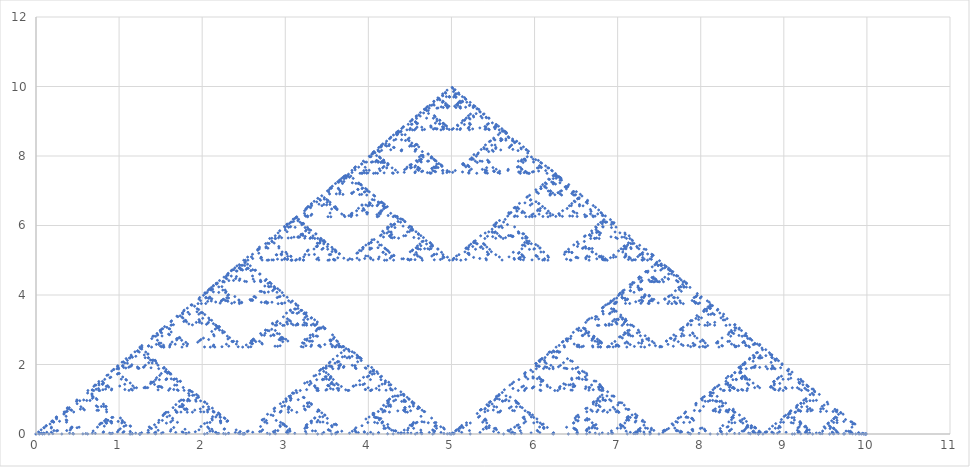
| Category | Series 0 |
|---|---|
| 0.0 | 0 |
| 0.0 | 0 |
| 2.5 | 5 |
| 1.25 | 2.5 |
| 0.625 | 1.25 |
| 2.8125 | 5.625 |
| 1.40625 | 2.812 |
| 5.703125 | 1.406 |
| 5.3515625 | 5.703 |
| 7.67578125 | 2.852 |
| 6.337890625 | 6.426 |
| 8.1689453125 | 3.213 |
| 9.08447265625 | 1.606 |
| 4.542236328125 | 0.803 |
| 4.7711181640625 | 5.402 |
| 4.88555908203125 | 7.701 |
| 2.442779541015625 | 3.85 |
| 6.2213897705078125 | 1.925 |
| 8.110694885253906 | 0.963 |
| 9.055347442626953 | 0.481 |
| 4.527673721313477 | 0.241 |
| 4.763836860656738 | 5.12 |
| 7.381918430328369 | 2.56 |
| 6.190959215164185 | 6.28 |
| 3.0954796075820923 | 3.14 |
| 4.047739803791046 | 6.57 |
| 4.523869901895523 | 8.285 |
| 7.2619349509477615 | 4.143 |
| 3.6309674754738808 | 2.071 |
| 4.31548373773694 | 6.036 |
| 2.15774186886847 | 3.018 |
| 6.078870934434235 | 1.509 |
| 3.0394354672171175 | 0.754 |
| 6.519717733608559 | 0.377 |
| 3.2598588668042794 | 0.189 |
| 4.12992943340214 | 5.094 |
| 4.56496471670107 | 7.547 |
| 4.782482358350535 | 8.774 |
| 7.3912411791752675 | 4.387 |
| 8.695620589587634 | 2.193 |
| 4.347810294793817 | 1.097 |
| 7.173905147396908 | 0.548 |
| 3.586952573698454 | 0.274 |
| 1.793476286849227 | 0.137 |
| 3.3967381434246136 | 5.069 |
| 6.698369071712307 | 2.534 |
| 8.349184535856153 | 1.267 |
| 4.174592267928077 | 0.634 |
| 7.087296133964038 | 0.317 |
| 8.54364806698202 | 0.158 |
| 9.27182403349101 | 0.079 |
| 4.635912016745505 | 0.04 |
| 2.3179560083727524 | 0.02 |
| 1.1589780041863762 | 0.01 |
| 3.0794890020931884 | 5.005 |
| 6.539744501046594 | 2.502 |
| 8.269872250523298 | 1.251 |
| 9.13493612526165 | 0.626 |
| 7.067468062630825 | 5.313 |
| 6.033734031315412 | 7.656 |
| 5.516867015657706 | 8.828 |
| 2.758433507828853 | 4.414 |
| 3.8792167539144264 | 7.207 |
| 1.9396083769572132 | 3.604 |
| 3.469804188478607 | 6.802 |
| 1.7349020942393034 | 3.401 |
| 0.8674510471196517 | 1.7 |
| 2.933725523559826 | 5.85 |
| 6.466862761779913 | 2.925 |
| 3.2334313808899564 | 1.463 |
| 6.616715690444979 | 0.731 |
| 3.3083578452224893 | 0.366 |
| 6.654178922611244 | 0.183 |
| 3.327089461305622 | 0.091 |
| 6.663544730652811 | 0.046 |
| 5.8317723653264055 | 5.023 |
| 5.415886182663202 | 7.511 |
| 7.707943091331601 | 3.756 |
| 8.8539715456658 | 1.878 |
| 4.4269857728329 | 0.939 |
| 7.21349288641645 | 0.469 |
| 8.606746443208225 | 0.235 |
| 6.8033732216041125 | 5.117 |
| 8.401686610802056 | 2.559 |
| 6.700843305401028 | 6.279 |
| 8.350421652700515 | 3.14 |
| 9.175210826350257 | 1.57 |
| 7.087605413175129 | 5.785 |
| 8.543802706587565 | 2.892 |
| 6.771901353293782 | 6.446 |
| 3.385950676646891 | 3.223 |
| 4.192975338323445 | 6.612 |
| 7.096487669161723 | 3.306 |
| 3.5482438345808616 | 1.653 |
| 1.7741219172904308 | 0.826 |
| 3.3870609586452156 | 5.413 |
| 1.6935304793226078 | 2.707 |
| 5.846765239661304 | 1.353 |
| 7.923382619830652 | 0.677 |
| 8.961691309915325 | 0.338 |
| 4.480845654957663 | 0.169 |
| 7.240422827478831 | 0.085 |
| 6.1202114137394155 | 5.042 |
| 5.560105706869708 | 7.521 |
| 2.780052853434854 | 3.761 |
| 6.3900264267174265 | 1.88 |
| 8.195013213358713 | 0.94 |
| 9.097506606679357 | 0.47 |
| 9.548753303339678 | 0.235 |
| 4.774376651669839 | 0.118 |
| 7.38718832583492 | 0.059 |
| 8.69359416291746 | 0.029 |
| 6.84679708145873 | 5.015 |
| 3.423398540729365 | 2.507 |
| 1.7116992703646825 | 1.254 |
| 3.3558496351823415 | 5.627 |
| 4.177924817591171 | 7.813 |
| 7.088962408795585 | 3.907 |
| 3.5444812043977927 | 1.953 |
| 1.7722406021988963 | 0.977 |
| 3.3861203010994485 | 5.488 |
| 1.6930601505497243 | 2.744 |
| 0.8465300752748621 | 1.372 |
| 0.42326503763743106 | 0.686 |
| 0.21163251881871553 | 0.343 |
| 2.6058162594093575 | 5.172 |
| 3.8029081297046785 | 7.586 |
| 4.40145406485234 | 8.793 |
| 4.70072703242617 | 9.396 |
| 2.350363516213085 | 4.698 |
| 6.175181758106543 | 2.349 |
| 3.0875908790532716 | 1.175 |
| 4.043795439526636 | 5.587 |
| 7.021897719763318 | 2.794 |
| 3.510948859881659 | 1.397 |
| 4.255474429940829 | 5.698 |
| 4.627737214970415 | 7.849 |
| 7.313868607485207 | 3.925 |
| 8.656934303742604 | 1.962 |
| 4.328467151871302 | 0.981 |
| 2.164233575935651 | 0.491 |
| 1.0821167879678255 | 0.245 |
| 5.541058393983913 | 0.123 |
| 7.770529196991957 | 0.061 |
| 6.385264598495978 | 5.031 |
| 3.192632299247989 | 2.515 |
| 1.5963161496239946 | 1.258 |
| 3.2981580748119974 | 5.629 |
| 4.149079037405999 | 7.814 |
| 2.0745395187029994 | 3.907 |
| 6.037269759351499 | 1.954 |
| 8.01863487967575 | 0.977 |
| 4.009317439837875 | 0.488 |
| 4.504658719918938 | 5.244 |
| 7.252329359959469 | 2.622 |
| 3.6261646799797345 | 1.311 |
| 4.313082339989867 | 5.656 |
| 7.1565411699949335 | 2.828 |
| 8.578270584997467 | 1.414 |
| 9.289135292498734 | 0.707 |
| 4.644567646249367 | 0.353 |
| 4.822283823124684 | 5.177 |
| 2.411141911562342 | 2.588 |
| 3.705570955781171 | 6.294 |
| 6.852785477890585 | 3.147 |
| 8.426392738945292 | 1.574 |
| 4.213196369472646 | 0.787 |
| 7.106598184736323 | 0.393 |
| 8.553299092368162 | 0.197 |
| 9.276649546184082 | 0.098 |
| 9.638324773092041 | 0.049 |
| 9.81916238654602 | 0.025 |
| 4.90958119327301 | 0.012 |
| 2.454790596636505 | 0.006 |
| 6.227395298318253 | 0.003 |
| 8.113697649159127 | 0.002 |
| 4.056848824579563 | 0.001 |
| 2.0284244122897817 | 0 |
| 3.514212206144891 | 5 |
| 1.7571061030724455 | 2.5 |
| 5.8785530515362225 | 1.25 |
| 2.9392765257681113 | 0.625 |
| 6.469638262884056 | 0.313 |
| 8.234819131442027 | 0.156 |
| 6.6174095657210135 | 5.078 |
| 5.808704782860507 | 7.539 |
| 5.404352391430253 | 8.77 |
| 2.7021761957151265 | 4.385 |
| 1.3510880978575632 | 2.192 |
| 0.6755440489287816 | 1.096 |
| 2.8377720244643907 | 5.548 |
| 3.9188860122321953 | 7.774 |
| 6.959443006116098 | 3.887 |
| 8.479721503058048 | 1.944 |
| 9.239860751529024 | 0.972 |
| 9.619930375764511 | 0.486 |
| 4.809965187882256 | 0.243 |
| 7.404982593941128 | 0.121 |
| 8.702491296970564 | 0.061 |
| 6.851245648485282 | 5.03 |
| 8.425622824242641 | 2.515 |
| 9.21281141212132 | 1.258 |
| 7.10640570606066 | 5.629 |
| 8.55320285303033 | 2.814 |
| 9.276601426515164 | 1.407 |
| 7.138300713257582 | 5.704 |
| 3.569150356628791 | 2.852 |
| 6.7845751783143955 | 1.426 |
| 8.392287589157197 | 0.713 |
| 9.1961437945786 | 0.356 |
| 7.0980718972893 | 5.178 |
| 3.54903594864465 | 2.589 |
| 6.774517974322325 | 1.295 |
| 3.3872589871611627 | 0.647 |
| 6.693629493580581 | 0.324 |
| 5.84681474679029 | 5.162 |
| 5.423407373395145 | 7.581 |
| 2.7117036866975726 | 3.79 |
| 6.355851843348786 | 1.895 |
| 8.177925921674394 | 0.948 |
| 4.088962960837197 | 0.474 |
| 7.0444814804185985 | 0.237 |
| 6.022240740209299 | 5.118 |
| 5.511120370104649 | 7.559 |
| 5.255560185052325 | 8.78 |
| 2.6277800925261623 | 4.39 |
| 1.3138900462630811 | 2.195 |
| 5.656945023131541 | 1.097 |
| 2.8284725115657703 | 0.549 |
| 3.9142362557828854 | 5.274 |
| 4.457118127891443 | 7.637 |
| 2.2285590639457213 | 3.819 |
| 3.6142795319728607 | 6.909 |
| 4.30713976598643 | 8.455 |
| 7.1535698829932155 | 4.227 |
| 6.076784941496608 | 7.114 |
| 8.038392470748304 | 3.557 |
| 6.519196235374152 | 6.778 |
| 3.259598117687076 | 3.389 |
| 6.629799058843538 | 1.695 |
| 3.314899529421769 | 0.847 |
| 6.657449764710885 | 0.424 |
| 8.328724882355441 | 0.212 |
| 9.16436244117772 | 0.106 |
| 9.582181220588861 | 0.053 |
| 4.791090610294431 | 0.026 |
| 7.395545305147215 | 0.013 |
| 8.697772652573608 | 0.007 |
| 6.848886326286804 | 5.003 |
| 5.924443163143402 | 7.502 |
| 2.962221581571701 | 3.751 |
| 3.9811107907858503 | 6.875 |
| 4.490555395392925 | 8.438 |
| 7.245277697696462 | 4.219 |
| 6.122638848848231 | 7.109 |
| 3.0613194244241155 | 3.555 |
| 6.530659712212058 | 1.777 |
| 8.265329856106028 | 0.889 |
| 4.132664928053014 | 0.444 |
| 7.066332464026507 | 0.222 |
| 6.0331662320132535 | 5.111 |
| 5.516583116006627 | 7.556 |
| 7.758291558003314 | 3.778 |
| 8.879145779001657 | 1.889 |
| 4.439572889500829 | 0.944 |
| 7.219786444750414 | 0.472 |
| 6.109893222375208 | 5.236 |
| 8.054946611187603 | 2.618 |
| 9.027473305593801 | 1.309 |
| 9.5137366527969 | 0.655 |
| 7.25686832639845 | 5.327 |
| 3.628434163199225 | 2.664 |
| 6.814217081599613 | 1.332 |
| 3.4071085407998063 | 0.666 |
| 4.203554270399903 | 5.333 |
| 4.601777135199951 | 7.666 |
| 7.3008885675999755 | 3.833 |
| 8.650444283799988 | 1.917 |
| 6.825222141899994 | 5.958 |
| 5.912611070949997 | 7.979 |
| 7.956305535474998 | 3.99 |
| 8.978152767737498 | 1.995 |
| 4.489076383868749 | 0.997 |
| 4.7445381919343745 | 5.499 |
| 4.872269095967187 | 7.749 |
| 7.436134547983594 | 3.875 |
| 6.218067273991797 | 6.937 |
| 5.609033636995898 | 8.469 |
| 2.804516818497949 | 4.234 |
| 1.4022584092489745 | 2.117 |
| 3.201129204624487 | 6.059 |
| 1.6005646023122435 | 3.029 |
| 0.8002823011561218 | 1.515 |
| 0.4001411505780609 | 0.757 |
| 0.20007057528903044 | 0.379 |
| 5.100035287644515 | 0.189 |
| 7.550017643822258 | 0.095 |
| 8.775008821911129 | 0.047 |
| 4.3875044109555645 | 0.024 |
| 7.193752205477782 | 0.012 |
| 8.596876102738891 | 0.006 |
| 4.298438051369446 | 0.003 |
| 4.649219025684722 | 5.001 |
| 7.324609512842361 | 2.501 |
| 6.162304756421181 | 6.25 |
| 8.08115237821059 | 3.125 |
| 6.540576189105295 | 6.563 |
| 8.270288094552647 | 3.281 |
| 6.635144047276324 | 6.641 |
| 8.317572023638162 | 3.32 |
| 4.158786011819081 | 1.66 |
| 7.079393005909541 | 0.83 |
| 6.0396965029547705 | 5.415 |
| 8.019848251477384 | 2.708 |
| 6.509924125738692 | 6.354 |
| 3.254962062869346 | 3.177 |
| 1.627481031434673 | 1.588 |
| 0.8137405157173365 | 0.794 |
| 5.406870257858668 | 0.397 |
| 5.203435128929334 | 5.199 |
| 2.601717564464667 | 2.599 |
| 3.8008587822323334 | 6.3 |
| 6.900429391116166 | 3.15 |
| 3.450214695558083 | 1.575 |
| 1.7251073477790415 | 0.787 |
| 0.8625536738895208 | 0.394 |
| 0.4312768369447604 | 0.197 |
| 0.2156384184723802 | 0.098 |
| 2.60781920923619 | 5.049 |
| 3.803909604618095 | 7.525 |
| 6.901954802309048 | 3.762 |
| 3.450977401154524 | 1.881 |
| 1.725488700577262 | 0.941 |
| 5.862744350288631 | 0.47 |
| 5.431372175144316 | 5.235 |
| 2.715686087572158 | 2.618 |
| 6.35784304378608 | 1.309 |
| 8.17892152189304 | 0.654 |
| 9.089460760946519 | 0.327 |
| 4.5447303804732595 | 0.164 |
| 7.27236519023663 | 0.082 |
| 8.636182595118315 | 0.041 |
| 6.818091297559158 | 5.02 |
| 5.909045648779578 | 7.51 |
| 5.454522824389789 | 8.755 |
| 7.727261412194895 | 4.378 |
| 3.8636307060974473 | 2.189 |
| 6.931815353048723 | 1.094 |
| 8.465907676524361 | 0.547 |
| 4.232953838262181 | 0.274 |
| 2.1164769191310904 | 0.137 |
| 1.0582384595655452 | 0.068 |
| 3.029119229782773 | 5.034 |
| 6.514559614891386 | 2.517 |
| 5.757279807445693 | 6.259 |
| 2.8786399037228465 | 3.129 |
| 1.4393199518614233 | 1.565 |
| 5.719659975930712 | 0.782 |
| 5.359829987965356 | 5.391 |
| 7.679914993982678 | 2.696 |
| 8.839957496991339 | 1.348 |
| 6.919978748495669 | 5.674 |
| 8.459989374247835 | 2.837 |
| 9.229994687123916 | 1.418 |
| 9.614997343561958 | 0.709 |
| 9.80749867178098 | 0.355 |
| 4.90374933589049 | 0.177 |
| 4.951874667945245 | 5.089 |
| 4.975937333972622 | 7.544 |
| 7.487968666986311 | 3.772 |
| 6.243984333493156 | 6.886 |
| 8.121992166746578 | 3.443 |
| 9.06099608337329 | 1.722 |
| 9.530498041686645 | 0.861 |
| 7.2652490208433225 | 5.43 |
| 6.132624510421661 | 7.715 |
| 5.56631225521083 | 8.858 |
| 5.283156127605415 | 9.429 |
| 2.6415780638027075 | 4.714 |
| 1.3207890319013538 | 2.357 |
| 3.160394515950677 | 6.179 |
| 4.080197257975339 | 8.089 |
| 2.0400986289876695 | 4.045 |
| 6.020049314493835 | 2.022 |
| 5.510024657246918 | 6.011 |
| 7.755012328623459 | 3.006 |
| 8.877506164311729 | 1.503 |
| 4.4387530821558645 | 0.751 |
| 2.2193765410779323 | 0.376 |
| 6.109688270538966 | 0.188 |
| 8.054844135269484 | 0.094 |
| 4.027422067634742 | 0.047 |
| 4.513711033817371 | 5.023 |
| 4.7568555169086855 | 7.512 |
| 7.378427758454343 | 3.756 |
| 6.189213879227172 | 6.878 |
| 5.594606939613586 | 8.439 |
| 5.297303469806793 | 9.219 |
| 7.648651734903396 | 4.61 |
| 6.324325867451698 | 7.305 |
| 5.662162933725849 | 8.652 |
| 2.8310814668629245 | 4.326 |
| 3.9155407334314623 | 7.163 |
| 1.9577703667157311 | 3.582 |
| 5.978885183357866 | 1.791 |
| 5.489442591678933 | 5.895 |
| 5.244721295839467 | 7.948 |
| 7.6223606479197334 | 3.974 |
| 6.311180323959867 | 6.987 |
| 5.655590161979934 | 8.493 |
| 2.827795080989967 | 4.247 |
| 1.4138975404949834 | 2.123 |
| 5.706948770247492 | 1.062 |
| 2.853474385123746 | 0.531 |
| 1.426737192561873 | 0.265 |
| 5.713368596280937 | 0.133 |
| 2.8566842981404683 | 0.066 |
| 1.4283421490702342 | 0.033 |
| 0.7141710745351171 | 0.017 |
| 2.8570855372675585 | 5.008 |
| 3.928542768633779 | 7.504 |
| 4.4642713843168895 | 8.752 |
| 4.732135692158445 | 9.376 |
| 7.366067846079222 | 4.688 |
| 8.683033923039611 | 2.344 |
| 9.341516961519805 | 1.172 |
| 7.170758480759902 | 5.586 |
| 6.085379240379951 | 7.793 |
| 5.542689620189975 | 8.897 |
| 2.7713448100949876 | 4.448 |
| 3.885672405047494 | 7.224 |
| 4.442836202523747 | 8.612 |
| 4.7214181012618734 | 9.306 |
| 7.360709050630937 | 4.653 |
| 6.180354525315469 | 7.327 |
| 8.090177262657734 | 3.663 |
| 9.045088631328866 | 1.832 |
| 9.522544315664433 | 0.916 |
| 4.761272157832217 | 0.458 |
| 4.880636078916108 | 5.229 |
| 7.440318039458054 | 2.614 |
| 6.220159019729027 | 6.307 |
| 8.110079509864514 | 3.154 |
| 9.055039754932256 | 1.577 |
| 7.027519877466128 | 5.788 |
| 6.013759938733064 | 7.894 |
| 8.006879969366532 | 3.947 |
| 6.503439984683266 | 6.974 |
| 3.251719992341633 | 3.487 |
| 6.625859996170817 | 1.743 |
| 3.3129299980854086 | 0.872 |
| 4.156464999042704 | 5.436 |
| 2.078232499521352 | 2.718 |
| 3.539116249760676 | 6.359 |
| 4.269558124880338 | 8.179 |
| 2.134779062440169 | 4.09 |
| 1.0673895312200845 | 2.045 |
| 5.533694765610042 | 1.022 |
| 5.266847382805021 | 5.511 |
| 7.633423691402511 | 2.756 |
| 3.8167118457012554 | 1.378 |
| 6.908355922850628 | 0.689 |
| 3.454177961425314 | 0.344 |
| 6.727088980712657 | 0.172 |
| 3.3635444903563285 | 0.086 |
| 1.6817722451781643 | 0.043 |
| 5.840886122589082 | 0.022 |
| 5.420443061294542 | 5.011 |
| 5.210221530647271 | 7.505 |
| 7.605110765323635 | 3.753 |
| 8.802555382661819 | 1.876 |
| 4.401277691330909 | 0.938 |
| 4.700638845665455 | 5.469 |
| 7.350319422832728 | 2.735 |
| 3.675159711416364 | 1.367 |
| 6.8375798557081815 | 0.684 |
| 3.4187899278540907 | 0.342 |
| 4.209394963927045 | 5.171 |
| 4.604697481963523 | 7.585 |
| 4.802348740981762 | 8.793 |
| 4.901174370490881 | 9.396 |
| 7.450587185245441 | 4.698 |
| 6.22529359262272 | 7.349 |
| 8.11264679631136 | 3.675 |
| 4.05632339815568 | 1.837 |
| 2.02816169907784 | 0.919 |
| 3.51408084953892 | 5.459 |
| 6.75704042476946 | 2.73 |
| 5.87852021238473 | 6.365 |
| 2.939260106192365 | 3.182 |
| 3.9696300530961826 | 6.591 |
| 6.984815026548091 | 3.296 |
| 3.4924075132740455 | 1.648 |
| 4.246203756637023 | 5.824 |
| 7.123101878318511 | 2.912 |
| 8.561550939159256 | 1.456 |
| 6.780775469579628 | 5.728 |
| 5.8903877347898135 | 7.864 |
| 5.445193867394907 | 8.932 |
| 5.222596933697453 | 9.466 |
| 7.6112984668487265 | 4.733 |
| 3.8056492334243632 | 2.366 |
| 4.402824616712182 | 6.183 |
| 2.201412308356091 | 3.092 |
| 6.100706154178045 | 1.546 |
| 5.550353077089023 | 5.773 |
| 7.775176538544511 | 2.886 |
| 8.887588269272255 | 1.443 |
| 9.443794134636128 | 0.722 |
| 9.721897067318064 | 0.361 |
| 7.360948533659032 | 5.18 |
| 8.680474266829517 | 2.59 |
| 9.340237133414758 | 1.295 |
| 4.670118566707379 | 0.648 |
| 4.83505928335369 | 5.324 |
| 7.417529641676845 | 2.662 |
| 8.708764820838422 | 1.331 |
| 4.354382410419211 | 0.665 |
| 4.677191205209605 | 5.333 |
| 4.838595602604803 | 7.666 |
| 7.419297801302402 | 3.833 |
| 8.709648900651201 | 1.917 |
| 9.354824450325602 | 0.958 |
| 7.177412225162801 | 5.479 |
| 8.5887061125814 | 2.74 |
| 9.2943530562907 | 1.37 |
| 4.64717652814535 | 0.685 |
| 7.323588264072675 | 0.342 |
| 8.661794132036338 | 0.171 |
| 4.330897066018169 | 0.086 |
| 2.1654485330090845 | 0.043 |
| 3.5827242665045422 | 5.021 |
| 6.791362133252271 | 2.511 |
| 5.8956810666261354 | 6.255 |
| 5.447840533313068 | 8.128 |
| 5.223920266656534 | 9.064 |
| 5.111960133328267 | 9.532 |
| 2.5559800666641337 | 4.766 |
| 6.277990033332067 | 2.383 |
| 3.1389950166660334 | 1.191 |
| 4.069497508333017 | 5.596 |
| 7.034748754166508 | 2.798 |
| 3.517374377083254 | 1.399 |
| 4.258687188541627 | 5.699 |
| 7.129343594270813 | 2.85 |
| 6.064671797135407 | 6.425 |
| 5.532335898567704 | 8.212 |
| 7.766167949283852 | 4.106 |
| 6.3830839746419255 | 7.053 |
| 5.691541987320963 | 8.527 |
| 5.345770993660482 | 9.263 |
| 5.172885496830241 | 9.632 |
| 5.08644274841512 | 9.816 |
| 5.04322137420756 | 9.908 |
| 2.52161068710378 | 4.954 |
| 3.76080534355189 | 7.477 |
| 6.880402671775945 | 3.738 |
| 5.940201335887973 | 6.869 |
| 5.470100667943987 | 8.435 |
| 7.735050333971993 | 4.217 |
| 6.367525166985997 | 7.109 |
| 5.683762583492999 | 8.554 |
| 5.3418812917465 | 9.277 |
| 5.17094064587325 | 9.639 |
| 7.585470322936625 | 4.819 |
| 6.292735161468313 | 7.41 |
| 5.6463675807341565 | 8.705 |
| 7.823183790367079 | 4.352 |
| 6.411591895183539 | 7.176 |
| 8.20579594759177 | 3.588 |
| 4.102897973795885 | 1.794 |
| 7.051448986897943 | 0.897 |
| 8.52572449344897 | 0.449 |
| 9.262862246724485 | 0.224 |
| 4.631431123362242 | 0.112 |
| 7.315715561681121 | 0.056 |
| 8.65785778084056 | 0.028 |
| 6.82892889042028 | 5.014 |
| 8.41446444521014 | 2.507 |
| 6.70723222260507 | 6.254 |
| 3.353616111302535 | 3.127 |
| 4.176808055651268 | 6.563 |
| 2.088404027825634 | 3.282 |
| 1.044202013912817 | 1.641 |
| 3.0221010069564085 | 5.82 |
| 1.5110505034782042 | 2.91 |
| 0.7555252517391021 | 1.455 |
| 0.37776262586955106 | 0.728 |
| 0.18888131293477553 | 0.364 |
| 0.09444065646738777 | 0.182 |
| 2.547220328233694 | 5.091 |
| 1.273610164116847 | 2.545 |
| 5.636805082058424 | 1.273 |
| 7.8184025410292115 | 0.636 |
| 6.409201270514606 | 5.318 |
| 8.204600635257304 | 2.659 |
| 9.102300317628652 | 1.33 |
| 7.051150158814326 | 5.665 |
| 8.525575079407163 | 2.832 |
| 4.262787539703582 | 1.416 |
| 4.63139376985179 | 5.708 |
| 4.815696884925895 | 7.854 |
| 4.907848442462948 | 8.927 |
| 2.453924221231474 | 4.464 |
| 6.226962110615737 | 2.232 |
| 8.113481055307869 | 1.116 |
| 9.056740527653934 | 0.558 |
| 4.528370263826967 | 0.279 |
| 2.2641851319134836 | 0.139 |
| 3.632092565956742 | 5.07 |
| 1.816046282978371 | 2.535 |
| 0.9080231414891855 | 1.267 |
| 0.45401157074459275 | 0.634 |
| 5.227005785372296 | 0.317 |
| 7.613502892686148 | 0.158 |
| 3.806751446343074 | 0.079 |
| 4.403375723171537 | 5.04 |
| 7.201687861585769 | 2.52 |
| 6.100843930792884 | 6.26 |
| 8.050421965396442 | 3.13 |
| 4.025210982698221 | 1.565 |
| 2.0126054913491105 | 0.782 |
| 3.5063027456745552 | 5.391 |
| 1.7531513728372776 | 2.696 |
| 0.8765756864186388 | 1.348 |
| 5.43828784320932 | 0.674 |
| 7.71914392160466 | 0.337 |
| 6.35957196080233 | 5.168 |
| 5.6797859804011654 | 7.584 |
| 2.8398929902005827 | 3.792 |
| 3.9199464951002914 | 6.896 |
| 1.9599732475501457 | 3.448 |
| 0.9799866237750728 | 1.724 |
| 5.489993311887536 | 0.862 |
| 2.744996655943768 | 0.431 |
| 3.872498327971884 | 5.216 |
| 4.436249163985942 | 7.608 |
| 7.218124581992971 | 3.804 |
| 8.609062290996485 | 1.902 |
| 4.304531145498243 | 0.951 |
| 7.152265572749121 | 0.475 |
| 6.0761327863745604 | 5.238 |
| 5.538066393187281 | 7.619 |
| 2.7690331965936403 | 3.809 |
| 1.3845165982968202 | 1.905 |
| 5.69225829914841 | 0.952 |
| 7.846129149574205 | 0.476 |
| 3.9230645747871025 | 0.238 |
| 1.9615322873935512 | 0.119 |
| 0.9807661436967756 | 0.06 |
| 2.990383071848388 | 5.03 |
| 3.995191535924194 | 7.515 |
| 4.497595767962097 | 8.757 |
| 2.2487978839810485 | 4.379 |
| 1.1243989419905243 | 2.189 |
| 5.562199470995262 | 1.095 |
| 5.281099735497631 | 5.547 |
| 5.140549867748815 | 7.774 |
| 7.5702749338744075 | 3.887 |
| 6.285137466937204 | 6.943 |
| 8.142568733468602 | 3.472 |
| 4.071284366734301 | 1.736 |
| 4.53564218336715 | 5.868 |
| 2.267821091683575 | 2.934 |
| 1.1339105458417875 | 1.467 |
| 0.5669552729208938 | 0.733 |
| 0.2834776364604469 | 0.367 |
| 5.141738818230223 | 0.183 |
| 7.570869409115112 | 0.092 |
| 8.785434704557556 | 0.046 |
| 4.392717352278778 | 0.023 |
| 7.196358676139389 | 0.011 |
| 6.098179338069695 | 5.006 |
| 8.049089669034847 | 2.503 |
| 4.024544834517424 | 1.251 |
| 7.012272417258712 | 0.626 |
| 3.506136208629356 | 0.313 |
| 6.7530681043146785 | 0.156 |
| 5.876534052157339 | 5.078 |
| 2.9382670260786696 | 2.539 |
| 1.4691335130393348 | 1.27 |
| 3.2345667565196674 | 5.635 |
| 4.117283378259834 | 7.817 |
| 7.058641689129917 | 3.909 |
| 3.5293208445649586 | 1.954 |
| 6.764660422282479 | 0.977 |
| 8.38233021114124 | 0.489 |
| 6.69116510557062 | 5.244 |
| 5.845582552785309 | 7.622 |
| 7.922791276392655 | 3.811 |
| 8.961395638196327 | 1.906 |
| 6.980697819098164 | 5.953 |
| 8.490348909549082 | 2.976 |
| 4.245174454774541 | 1.488 |
| 2.1225872273872706 | 0.744 |
| 3.5612936136936355 | 5.372 |
| 6.780646806846818 | 2.686 |
| 8.390323403423409 | 1.343 |
| 4.195161701711704 | 0.672 |
| 4.597580850855852 | 5.336 |
| 7.298790425427926 | 2.668 |
| 8.649395212713962 | 1.334 |
| 9.324697606356981 | 0.667 |
| 7.1623488031784905 | 5.333 |
| 6.081174401589245 | 7.667 |
| 3.0405872007946226 | 3.833 |
| 6.520293600397311 | 1.917 |
| 5.7601468001986555 | 5.958 |
| 2.8800734000993278 | 2.979 |
| 3.9400367000496637 | 6.49 |
| 1.9700183500248318 | 3.245 |
| 5.985009175012416 | 1.622 |
| 2.992504587506208 | 0.811 |
| 6.496252293753104 | 0.406 |
| 3.248126146876552 | 0.203 |
| 6.6240630734382755 | 0.101 |
| 5.812031536719138 | 5.051 |
| 5.406015768359569 | 7.525 |
| 7.703007884179785 | 3.763 |
| 8.851503942089892 | 1.881 |
| 6.925751971044946 | 5.941 |
| 5.962875985522473 | 7.97 |
| 2.9814379927612364 | 3.985 |
| 3.990718996380618 | 6.993 |
| 1.995359498190309 | 3.496 |
| 3.4976797490951546 | 6.748 |
| 6.748839874547578 | 3.374 |
| 8.374419937273789 | 1.687 |
| 6.687209968636894 | 5.844 |
| 8.343604984318446 | 2.922 |
| 6.671802492159223 | 6.461 |
| 5.835901246079612 | 8.23 |
| 5.417950623039806 | 9.115 |
| 7.708975311519903 | 4.558 |
| 8.854487655759952 | 2.279 |
| 9.427243827879977 | 1.139 |
| 9.713621913939988 | 0.57 |
| 9.856810956969994 | 0.285 |
| 7.428405478484997 | 5.142 |
| 6.2142027392424986 | 7.571 |
| 5.607101369621249 | 8.786 |
| 7.803550684810625 | 4.393 |
| 3.9017753424053123 | 2.196 |
| 1.9508876712026562 | 1.098 |
| 5.975443835601328 | 0.549 |
| 2.987721917800664 | 0.275 |
| 6.493860958900331 | 0.137 |
| 8.246930479450166 | 0.069 |
| 4.123465239725083 | 0.034 |
| 4.561732619862541 | 5.017 |
| 7.2808663099312705 | 2.509 |
| 3.6404331549656352 | 1.254 |
| 1.8202165774828176 | 0.627 |
| 0.9101082887414088 | 0.314 |
| 2.9550541443707043 | 5.157 |
| 1.4775270721853522 | 2.578 |
| 3.238763536092676 | 6.289 |
| 4.119381768046338 | 8.145 |
| 2.059690884023169 | 4.072 |
| 3.5298454420115846 | 7.036 |
| 4.264922721005792 | 8.518 |
| 2.132461360502896 | 4.259 |
| 3.566230680251448 | 7.13 |
| 1.783115340125724 | 3.565 |
| 3.391557670062862 | 6.782 |
| 1.695778835031431 | 3.391 |
| 3.3478894175157157 | 6.696 |
| 4.173944708757858 | 8.348 |
| 2.086972354378929 | 4.174 |
| 3.5434861771894646 | 7.087 |
| 4.271743088594732 | 8.543 |
| 2.135871544297366 | 4.272 |
| 6.067935772148683 | 2.136 |
| 5.5339678860743415 | 6.068 |
| 7.766983943037171 | 3.034 |
| 8.883491971518586 | 1.517 |
| 4.441745985759293 | 0.758 |
| 2.2208729928796465 | 0.379 |
| 6.110436496439823 | 0.19 |
| 8.055218248219912 | 0.095 |
| 9.027609124109956 | 0.047 |
| 4.513804562054978 | 0.024 |
| 2.256902281027489 | 0.012 |
| 1.1284511405137445 | 0.006 |
| 0.5642255702568723 | 0.003 |
| 2.782112785128436 | 5.001 |
| 1.391056392564218 | 2.501 |
| 0.695528196282109 | 1.25 |
| 0.3477640981410545 | 0.625 |
| 2.6738820490705275 | 5.313 |
| 3.836941024535264 | 7.656 |
| 6.918470512267632 | 3.828 |
| 8.459235256133816 | 1.914 |
| 4.229617628066908 | 0.957 |
| 7.114808814033454 | 0.479 |
| 3.557404407016727 | 0.239 |
| 4.278702203508363 | 5.12 |
| 2.1393511017541815 | 2.56 |
| 1.0696755508770908 | 1.28 |
| 3.0348377754385454 | 5.64 |
| 1.5174188877192727 | 2.82 |
| 0.7587094438596363 | 1.41 |
| 2.879354721929818 | 5.705 |
| 3.939677360964909 | 7.852 |
| 1.9698386804824546 | 3.926 |
| 0.9849193402412273 | 1.963 |
| 0.49245967012061365 | 0.982 |
| 0.24622983506030682 | 0.491 |
| 5.123114917530153 | 0.245 |
| 5.061557458765076 | 5.123 |
| 2.530778729382538 | 2.561 |
| 3.765389364691269 | 6.281 |
| 1.8826946823456345 | 3.14 |
| 3.4413473411728175 | 6.57 |
| 4.220673670586409 | 8.285 |
| 2.1103368352932046 | 4.143 |
| 3.5551684176466023 | 7.071 |
| 1.7775842088233011 | 3.536 |
| 5.8887921044116505 | 1.768 |
| 7.944396052205825 | 0.884 |
| 6.472198026102912 | 5.442 |
| 3.236099013051456 | 2.721 |
| 6.618049506525728 | 1.36 |
| 8.309024753262864 | 0.68 |
| 6.654512376631432 | 5.34 |
| 3.327256188315716 | 2.67 |
| 6.663628094157858 | 1.335 |
| 8.331814047078929 | 0.668 |
| 4.165907023539464 | 0.334 |
| 4.582953511769732 | 5.167 |
| 2.291476755884866 | 2.583 |
| 1.145738377942433 | 1.292 |
| 3.0728691889712163 | 5.646 |
| 4.036434594485608 | 7.823 |
| 4.5182172972428045 | 8.911 |
| 7.259108648621402 | 4.456 |
| 6.129554324310702 | 7.228 |
| 5.564777162155351 | 8.614 |
| 7.782388581077676 | 4.307 |
| 8.891194290538838 | 2.153 |
| 6.945597145269419 | 6.077 |
| 3.4727985726347095 | 3.038 |
| 1.7363992863173547 | 1.519 |
| 3.368199643158677 | 5.76 |
| 4.184099821579339 | 7.88 |
| 2.0920499107896693 | 3.94 |
| 1.0460249553948346 | 1.97 |
| 3.023012477697417 | 5.985 |
| 4.011506238848709 | 7.992 |
| 4.505753119424354 | 8.996 |
| 7.252876559712178 | 4.498 |
| 3.626438279856089 | 2.249 |
| 6.813219139928044 | 1.125 |
| 5.906609569964022 | 5.562 |
| 2.953304784982011 | 2.781 |
| 6.4766523924910055 | 1.391 |
| 5.738326196245502 | 5.695 |
| 5.369163098122751 | 7.848 |
| 7.684581549061376 | 3.924 |
| 3.842290774530688 | 1.962 |
| 1.921145387265344 | 0.981 |
| 5.960572693632672 | 0.49 |
| 5.480286346816336 | 5.245 |
| 5.240143173408168 | 7.623 |
| 7.620071586704084 | 3.811 |
| 6.310035793352042 | 6.906 |
| 5.655017896676021 | 8.453 |
| 7.827508948338011 | 4.226 |
| 3.9137544741690053 | 2.113 |
| 1.9568772370845027 | 1.057 |
| 3.4784386185422513 | 5.528 |
| 4.2392193092711254 | 7.764 |
| 7.119609654635562 | 3.882 |
| 3.559804827317781 | 1.941 |
| 4.27990241365889 | 5.971 |
| 7.139951206829445 | 2.985 |
| 6.069975603414722 | 6.493 |
| 5.534987801707361 | 8.246 |
| 5.2674939008536805 | 9.123 |
| 5.13374695042684 | 9.562 |
| 7.56687347521342 | 4.781 |
| 6.28343673760671 | 7.39 |
| 8.141718368803355 | 3.695 |
| 6.5708591844016775 | 6.848 |
| 5.785429592200838 | 8.424 |
| 5.392714796100419 | 9.212 |
| 2.6963573980502096 | 4.606 |
| 1.3481786990251048 | 2.303 |
| 0.6740893495125524 | 1.151 |
| 0.3370446747562762 | 0.576 |
| 0.1685223373781381 | 0.288 |
| 5.0842611686890695 | 0.144 |
| 2.5421305843445348 | 0.072 |
| 1.2710652921722674 | 0.036 |
| 3.1355326460861335 | 5.018 |
| 6.567766323043067 | 2.509 |
| 8.283883161521533 | 1.254 |
| 9.141941580760767 | 0.627 |
| 4.570970790380383 | 0.314 |
| 4.785485395190191 | 5.157 |
| 4.892742697595096 | 7.578 |
| 4.946371348797548 | 8.789 |
| 7.473185674398774 | 4.395 |
| 8.736592837199387 | 2.197 |
| 6.8682964185996935 | 6.099 |
| 3.4341482092998468 | 3.049 |
| 6.717074104649923 | 1.525 |
| 5.858537052324961 | 5.762 |
| 2.9292685261624807 | 2.881 |
| 6.464634263081241 | 1.441 |
| 3.2323171315406203 | 0.72 |
| 4.11615856577031 | 5.36 |
| 4.558079282885155 | 7.68 |
| 2.2790396414425773 | 3.84 |
| 6.139519820721288 | 1.92 |
| 5.569759910360644 | 5.96 |
| 7.7848799551803225 | 2.98 |
| 6.392439977590161 | 6.49 |
| 5.696219988795081 | 8.245 |
| 2.8481099943975403 | 4.123 |
| 3.92405499719877 | 7.061 |
| 6.962027498599385 | 3.531 |
| 8.481013749299692 | 1.765 |
| 6.740506874649846 | 5.883 |
| 8.370253437324923 | 2.941 |
| 9.185126718662461 | 1.471 |
| 4.592563359331231 | 0.735 |
| 7.296281679665615 | 0.368 |
| 8.648140839832807 | 0.184 |
| 4.324070419916404 | 0.092 |
| 2.162035209958202 | 0.046 |
| 3.5810176049791007 | 5.023 |
| 4.29050880248955 | 7.511 |
| 7.145254401244776 | 3.756 |
| 3.572627200622388 | 1.878 |
| 6.786313600311194 | 0.939 |
| 8.393156800155598 | 0.469 |
| 6.696578400077799 | 5.235 |
| 5.8482892000388995 | 7.617 |
| 7.924144600019449 | 3.809 |
| 3.9620723000097247 | 1.904 |
| 1.9810361500048623 | 0.952 |
| 5.990518075002432 | 0.476 |
| 2.995259037501216 | 0.238 |
| 3.9976295187506077 | 5.119 |
| 6.998814759375303 | 2.56 |
| 3.4994073796876517 | 1.28 |
| 6.749703689843826 | 0.64 |
| 8.374851844921913 | 0.32 |
| 4.187425922460957 | 0.16 |
| 2.0937129612304783 | 0.08 |
| 1.0468564806152392 | 0.04 |
| 3.0234282403076196 | 5.02 |
| 1.5117141201538098 | 2.51 |
| 0.7558570600769049 | 1.255 |
| 2.8779285300384525 | 5.627 |
| 6.4389642650192265 | 2.814 |
| 8.219482132509613 | 1.407 |
| 6.609741066254807 | 5.703 |
| 5.804870533127403 | 7.852 |
| 2.9024352665637014 | 3.926 |
| 3.9512176332818507 | 6.963 |
| 4.475608816640925 | 8.481 |
| 2.2378044083204625 | 4.241 |
| 6.118902204160231 | 2.12 |
| 3.0594511020801156 | 1.06 |
| 1.5297255510400578 | 0.53 |
| 3.2648627755200286 | 5.265 |
| 4.132431387760015 | 7.633 |
| 2.0662156938800074 | 3.816 |
| 3.5331078469400037 | 6.908 |
| 1.7665539234700018 | 3.454 |
| 5.8832769617350005 | 1.727 |
| 7.9416384808675 | 0.864 |
| 3.97081924043375 | 0.432 |
| 1.985409620216875 | 0.216 |
| 0.9927048101084375 | 0.108 |
| 2.996352405054219 | 5.054 |
| 1.4981762025271095 | 2.527 |
| 3.2490881012635544 | 6.263 |
| 1.6245440506317772 | 3.132 |
| 5.812272025315889 | 1.566 |
| 5.406136012657944 | 5.783 |
| 2.703068006328972 | 2.891 |
| 6.3515340031644865 | 1.446 |
| 8.175767001582244 | 0.723 |
| 6.587883500791122 | 5.361 |
| 5.793941750395561 | 7.681 |
| 7.8969708751977805 | 3.84 |
| 6.44848543759889 | 6.92 |
| 3.224242718799445 | 3.46 |
| 1.6121213593997226 | 1.73 |
| 3.3060606796998613 | 5.865 |
| 6.653030339849931 | 2.933 |
| 8.326515169924965 | 1.466 |
| 6.663257584962483 | 5.733 |
| 8.331628792481242 | 2.867 |
| 4.165814396240621 | 1.433 |
| 2.0829071981203104 | 0.717 |
| 1.0414535990601552 | 0.358 |
| 3.0207267995300775 | 5.179 |
| 4.010363399765039 | 7.59 |
| 4.505181699882519 | 8.795 |
| 2.2525908499412597 | 4.397 |
| 6.12629542497063 | 2.199 |
| 3.063147712485315 | 1.099 |
| 1.5315738562426575 | 0.55 |
| 0.7657869281213288 | 0.275 |
| 5.382893464060664 | 0.137 |
| 2.691446732030332 | 0.069 |
| 1.345723366015166 | 0.034 |
| 3.172861683007583 | 5.017 |
| 4.086430841503791 | 7.509 |
| 2.0432154207518956 | 3.754 |
| 6.021607710375948 | 1.877 |
| 3.010803855187974 | 0.939 |
| 4.0054019275939865 | 5.469 |
| 4.502700963796993 | 7.735 |
| 4.751350481898497 | 8.867 |
| 7.375675240949248 | 4.434 |
| 3.687837620474624 | 2.217 |
| 1.843918810237312 | 1.108 |
| 3.421959405118656 | 5.554 |
| 6.710979702559328 | 2.777 |
| 3.355489851279664 | 1.389 |
| 6.677744925639832 | 0.694 |
| 8.338872462819916 | 0.347 |
| 9.169436231409957 | 0.174 |
| 7.084718115704979 | 5.087 |
| 8.54235905785249 | 2.543 |
| 4.271179528926245 | 1.272 |
| 2.1355897644631225 | 0.636 |
| 6.067794882231562 | 0.318 |
| 5.533897441115781 | 5.159 |
| 7.76694872055789 | 2.579 |
| 8.883474360278946 | 1.29 |
| 9.441737180139473 | 0.645 |
| 4.7208685900697365 | 0.322 |
| 7.360434295034868 | 0.161 |
| 3.680217147517434 | 0.081 |
| 1.840108573758717 | 0.04 |
| 0.9200542868793585 | 0.02 |
| 2.960027143439679 | 5.01 |
| 3.9800135717198395 | 7.505 |
| 1.9900067858599197 | 3.753 |
| 0.9950033929299599 | 1.876 |
| 2.9975016964649797 | 5.938 |
| 1.4987508482324898 | 2.969 |
| 3.249375424116245 | 6.485 |
| 4.1246877120581225 | 8.242 |
| 7.062343856029061 | 4.121 |
| 8.53117192801453 | 2.061 |
| 6.765585964007265 | 6.03 |
| 3.3827929820036324 | 3.015 |
| 4.191396491001816 | 6.508 |
| 7.095698245500908 | 3.254 |
| 3.547849122750454 | 1.627 |
| 4.273924561375227 | 5.813 |
| 4.636962280687614 | 7.907 |
| 7.318481140343807 | 3.953 |
| 3.6592405701719035 | 1.977 |
| 1.8296202850859518 | 0.988 |
| 3.4148101425429758 | 5.494 |
| 6.707405071271488 | 2.747 |
| 3.353702535635744 | 1.374 |
| 1.676851267817872 | 0.687 |
| 0.838425633908936 | 0.343 |
| 0.419212816954468 | 0.172 |
| 2.7096064084772338 | 5.086 |
| 6.3548032042386176 | 2.543 |
| 5.677401602119309 | 6.271 |
| 7.838700801059654 | 3.136 |
| 6.419350400529828 | 6.568 |
| 5.709675200264914 | 8.284 |
| 5.354837600132457 | 9.142 |
| 7.677418800066229 | 4.571 |
| 8.838709400033114 | 2.285 |
| 4.419354700016557 | 1.143 |
| 2.2096773500082785 | 0.571 |
| 6.104838675004139 | 0.286 |
| 3.0524193375020694 | 0.143 |
| 4.026209668751035 | 5.071 |
| 7.013104834375517 | 2.536 |
| 6.006552417187759 | 6.268 |
| 5.50327620859388 | 8.134 |
| 2.75163810429694 | 4.067 |
| 3.87581905214847 | 7.033 |
| 1.937909526074235 | 3.517 |
| 3.468954763037117 | 6.758 |
| 6.734477381518559 | 3.379 |
| 3.3672386907592795 | 1.69 |
| 1.6836193453796398 | 0.845 |
| 0.8418096726898199 | 0.422 |
| 5.42090483634491 | 0.211 |
| 7.710452418172455 | 0.106 |
| 8.855226209086227 | 0.053 |
| 9.427613104543113 | 0.026 |
| 7.213806552271556 | 5.013 |
| 3.606903276135778 | 2.507 |
| 6.803451638067889 | 1.253 |
| 8.401725819033945 | 0.627 |
| 9.200862909516973 | 0.313 |
| 9.600431454758485 | 0.157 |
| 9.800215727379243 | 0.078 |
| 9.900107863689621 | 0.039 |
| 9.95005393184481 | 0.02 |
| 4.975026965922405 | 0.01 |
| 2.4875134829612024 | 0.005 |
| 1.2437567414806012 | 0.002 |
| 0.6218783707403006 | 0.001 |
| 0.3109391853701503 | 0.001 |
| 0.15546959268507515 | 0 |
| 0.07773479634253758 | 0 |
| 0.03886739817126879 | 0 |
| 2.519433699085634 | 5 |
| 6.2597168495428175 | 2.5 |
| 3.1298584247714087 | 1.25 |
| 1.5649292123857044 | 0.625 |
| 0.7824646061928522 | 0.313 |
| 2.8912323030964258 | 5.156 |
| 3.945616151548213 | 7.578 |
| 6.972808075774106 | 3.789 |
| 3.486404037887053 | 1.895 |
| 4.243202018943526 | 5.947 |
| 7.121601009471763 | 2.974 |
| 3.5608005047358815 | 1.487 |
| 4.280400252367941 | 5.743 |
| 7.14020012618397 | 2.872 |
| 3.570100063091985 | 1.436 |
| 1.7850500315459925 | 0.718 |
| 5.892525015772996 | 0.359 |
| 5.446262507886498 | 5.179 |
| 2.723131253943249 | 2.59 |
| 3.8615656269716245 | 6.295 |
| 6.930782813485813 | 3.147 |
| 3.4653914067429064 | 1.574 |
| 1.7326957033714532 | 0.787 |
| 0.8663478516857266 | 0.393 |
| 0.4331739258428633 | 0.197 |
| 5.216586962921431 | 0.098 |
| 2.6082934814607155 | 0.049 |
| 3.8041467407303577 | 5.025 |
| 6.902073370365178 | 2.512 |
| 8.45103668518259 | 1.256 |
| 6.725518342591295 | 5.628 |
| 5.8627591712956475 | 7.814 |
| 5.431379585647823 | 8.907 |
| 5.215689792823912 | 9.454 |
| 2.607844896411956 | 4.727 |
| 6.303922448205977 | 2.363 |
| 8.151961224102989 | 1.182 |
| 9.075980612051495 | 0.591 |
| 4.537990306025748 | 0.295 |
| 2.268995153012874 | 0.148 |
| 1.134497576506437 | 0.074 |
| 5.5672487882532184 | 0.037 |
| 2.7836243941266092 | 0.018 |
| 3.8918121970633046 | 5.009 |
| 6.945906098531653 | 2.505 |
| 5.9729530492658265 | 6.252 |
| 2.9864765246329132 | 3.126 |
| 3.9932382623164564 | 6.563 |
| 4.496619131158228 | 8.282 |
| 2.248309565579114 | 4.141 |
| 6.124154782789557 | 2.07 |
| 3.0620773913947783 | 1.035 |
| 4.031038695697389 | 5.518 |
| 2.0155193478486946 | 2.759 |
| 1.0077596739243473 | 1.379 |
| 5.503879836962174 | 0.69 |
| 2.751939918481087 | 0.345 |
| 1.3759699592405434 | 0.172 |
| 0.6879849796202717 | 0.086 |
| 5.343992489810136 | 0.043 |
| 5.171996244905068 | 5.022 |
| 2.585998122452534 | 2.511 |
| 3.7929990612262667 | 6.255 |
| 6.896499530613133 | 3.128 |
| 3.4482497653065667 | 1.564 |
| 4.224124882653284 | 5.782 |
| 4.612062441326642 | 7.891 |
| 4.806031220663321 | 8.945 |
| 2.4030156103316607 | 4.473 |
| 1.2015078051658303 | 2.236 |
| 3.100753902582915 | 6.118 |
| 4.050376951291458 | 8.059 |
| 4.525188475645729 | 9.03 |
| 2.2625942378228645 | 4.515 |
| 3.6312971189114323 | 7.257 |
| 6.815648559455717 | 3.629 |
| 5.907824279727858 | 6.814 |
| 7.953912139863929 | 3.407 |
| 6.476956069931965 | 6.704 |
| 3.2384780349659823 | 3.352 |
| 4.119239017482991 | 6.676 |
| 7.059619508741496 | 3.338 |
| 8.529809754370747 | 1.669 |
| 4.264904877185374 | 0.834 |
| 4.632452438592686 | 5.417 |
| 4.816226219296343 | 7.709 |
| 7.408113109648172 | 3.854 |
| 3.704056554824086 | 1.927 |
| 6.8520282774120425 | 0.964 |
| 5.926014138706021 | 5.482 |
| 2.9630070693530106 | 2.741 |
| 6.481503534676506 | 1.37 |
| 5.740751767338253 | 5.685 |
| 7.870375883669126 | 2.843 |
| 3.935187941834563 | 1.421 |
| 6.967593970917282 | 0.711 |
| 8.48379698545864 | 0.355 |
| 6.74189849272932 | 5.178 |
| 8.37094924636466 | 2.589 |
| 9.18547462318233 | 1.294 |
| 9.592737311591165 | 0.647 |
| 4.7963686557955825 | 0.324 |
| 4.898184327897791 | 5.162 |
| 4.949092163948896 | 7.581 |
| 2.474546081974448 | 3.79 |
| 1.237273040987224 | 1.895 |
| 3.118636520493612 | 5.948 |
| 6.5593182602468065 | 2.974 |
| 5.779659130123403 | 6.487 |
| 5.389829565061701 | 8.243 |
| 7.694914782530851 | 4.122 |
| 8.847457391265426 | 2.061 |
| 6.923728695632713 | 6.03 |
| 8.461864347816356 | 3.015 |
| 9.230932173908178 | 1.508 |
| 4.615466086954089 | 0.754 |
| 2.3077330434770444 | 0.377 |
| 6.1538665217385216 | 0.188 |
| 5.576933260869261 | 5.094 |
| 7.78846663043463 | 2.547 |
| 8.894233315217315 | 1.274 |
| 4.447116657608658 | 0.637 |
| 2.223558328804329 | 0.318 |
| 6.111779164402165 | 0.159 |
| 3.0558895822010825 | 0.08 |
| 1.5279447911005413 | 0.04 |
| 5.763972395550271 | 0.02 |
| 2.8819861977751353 | 0.01 |
| 1.4409930988875677 | 0.005 |
| 3.2204965494437836 | 5.002 |
| 4.110248274721892 | 7.501 |
| 4.555124137360946 | 8.751 |
| 7.2775620686804725 | 4.375 |
| 8.638781034340237 | 2.188 |
| 4.319390517170119 | 1.094 |
| 4.659695258585059 | 5.547 |
| 2.3298476292925296 | 2.773 |
| 1.1649238146462648 | 1.387 |
| 0.5824619073231324 | 0.693 |
| 2.7912309536615663 | 5.347 |
| 6.395615476830783 | 2.673 |
| 5.697807738415392 | 6.337 |
| 2.848903869207696 | 3.168 |
| 3.924451934603848 | 6.584 |
| 1.962225967301924 | 3.292 |
| 5.981112983650962 | 1.646 |
| 5.4905564918254814 | 5.823 |
| 5.245278245912741 | 7.912 |
| 5.12263912295637 | 8.956 |
| 5.061319561478185 | 9.478 |
| 2.5306597807390925 | 4.739 |
| 6.2653298903695465 | 2.369 |
| 8.132664945184773 | 1.185 |
| 4.066332472592387 | 0.592 |
| 4.533166236296193 | 5.296 |
| 4.766583118148096 | 7.648 |
| 7.383291559074048 | 3.824 |
| 6.1916457795370246 | 6.912 |
| 5.595822889768512 | 8.456 |
| 7.797911444884257 | 4.228 |
| 8.898955722442128 | 2.114 |
| 6.949477861221064 | 6.057 |
| 3.474738930610532 | 3.029 |
| 1.737369465305266 | 1.514 |
| 3.368684732652633 | 5.757 |
| 4.184342366326316 | 7.879 |
| 4.592171183163158 | 8.939 |
| 2.296085591581579 | 4.47 |
| 1.1480427957907895 | 2.235 |
| 5.574021397895395 | 1.117 |
| 5.2870106989476975 | 5.559 |
| 5.143505349473848 | 7.779 |
| 5.071752674736924 | 8.89 |
| 7.535876337368462 | 4.445 |
| 3.767938168684231 | 2.222 |
| 1.8839690843421155 | 1.111 |
| 5.941984542171058 | 0.556 |
| 2.970992271085529 | 0.278 |
| 6.485496135542764 | 0.139 |
| 8.242748067771382 | 0.069 |
| 4.121374033885691 | 0.035 |
| 2.0606870169428455 | 0.017 |
| 3.5303435084714225 | 5.009 |
| 6.765171754235711 | 2.504 |
| 3.3825858771178554 | 1.252 |
| 1.6912929385589277 | 0.626 |
| 0.8456464692794639 | 0.313 |
| 5.422823234639732 | 0.157 |
| 2.711411617319866 | 0.078 |
| 1.355705808659933 | 0.039 |
| 0.6778529043299665 | 0.02 |
| 2.8389264521649835 | 5.01 |
| 3.9194632260824918 | 7.505 |
| 6.959731613041246 | 3.752 |
| 8.479865806520623 | 1.876 |
| 4.2399329032603115 | 0.938 |
| 4.619966451630155 | 5.469 |
| 2.3099832258150776 | 2.735 |
| 6.154991612907539 | 1.367 |
| 3.0774958064537694 | 0.684 |
| 4.038747903226884 | 5.342 |
| 4.519373951613442 | 7.671 |
| 7.259686975806721 | 3.835 |
| 8.629843487903361 | 1.918 |
| 9.31492174395168 | 0.959 |
| 7.15746087197584 | 5.479 |
| 3.57873043598792 | 2.74 |
| 6.789365217993961 | 1.37 |
| 5.89468260899698 | 5.685 |
| 5.44734130449849 | 7.842 |
| 7.723670652249245 | 3.921 |
| 8.861835326124623 | 1.961 |
| 4.430917663062312 | 0.98 |
| 2.215458831531156 | 0.49 |
| 3.607729415765578 | 5.245 |
| 6.80386470788279 | 2.623 |
| 8.401932353941394 | 1.311 |
| 9.200966176970697 | 0.656 |
| 7.1004830884853485 | 5.328 |
| 6.050241544242674 | 7.664 |
| 5.525120772121337 | 8.832 |
| 5.2625603860606684 | 9.416 |
| 5.131280193030334 | 9.708 |
| 7.565640096515168 | 4.854 |
| 8.782820048257584 | 2.427 |
| 4.391410024128792 | 1.213 |
| 2.195705012064396 | 0.607 |
| 3.597852506032198 | 5.303 |
| 6.7989262530160985 | 2.652 |
| 8.39946312650805 | 1.326 |
| 9.199731563254025 | 0.663 |
| 9.599865781627013 | 0.331 |
| 7.299932890813507 | 5.166 |
| 8.649966445406754 | 2.583 |
| 6.824983222703377 | 6.291 |
| 8.412491611351689 | 3.146 |
| 6.706245805675844 | 6.573 |
| 3.353122902837922 | 3.286 |
| 4.176561451418961 | 6.643 |
| 4.588280725709481 | 8.322 |
| 4.7941403628547405 | 9.161 |
| 4.89707018142737 | 9.58 |
| 2.448535090713685 | 4.79 |
| 1.2242675453568426 | 2.395 |
| 3.1121337726784213 | 6.198 |
| 4.05606688633921 | 8.099 |
| 4.528033443169605 | 9.049 |
| 7.264016721584802 | 4.525 |
| 8.632008360792401 | 2.262 |
| 9.3160041803962 | 1.131 |
| 9.6580020901981 | 0.566 |
| 9.82900104509905 | 0.283 |
| 4.914500522549525 | 0.141 |
| 2.4572502612747624 | 0.071 |
| 6.228625130637381 | 0.035 |
| 3.1143125653186905 | 0.018 |
| 4.057156282659346 | 5.009 |
| 2.028578141329673 | 2.504 |
| 3.5142890706648364 | 6.252 |
| 6.757144535332419 | 3.126 |
| 3.3785722676662093 | 1.563 |
| 4.189286133833105 | 5.782 |
| 7.094643066916552 | 2.891 |
| 3.547321533458276 | 1.445 |
| 4.273660766729138 | 5.723 |
| 2.136830383364569 | 2.861 |
| 1.0684151916822846 | 1.431 |
| 0.5342075958411423 | 0.715 |
| 2.767103797920571 | 5.358 |
| 3.8835518989602855 | 7.679 |
| 6.941775949480142 | 3.839 |
| 8.470887974740071 | 1.92 |
| 6.735443987370036 | 5.96 |
| 8.367721993685018 | 2.98 |
| 9.183860996842508 | 1.49 |
| 7.091930498421254 | 5.745 |
| 6.045965249210627 | 7.872 |
| 3.0229826246053135 | 3.936 |
| 4.011491312302657 | 6.968 |
| 2.0057456561513285 | 3.484 |
| 1.0028728280756642 | 1.742 |
| 3.0014364140378325 | 5.871 |
| 1.5007182070189162 | 2.936 |
| 3.2503591035094583 | 6.468 |
| 1.6251795517547292 | 3.234 |
| 3.3125897758773646 | 6.617 |
| 4.1562948879386825 | 8.308 |
| 4.578147443969341 | 9.154 |
| 4.78907372198467 | 9.577 |
| 4.894536860992336 | 9.789 |
| 4.947268430496168 | 9.894 |
| 7.473634215248084 | 4.947 |
| 8.736817107624042 | 2.474 |
| 9.36840855381202 | 1.237 |
| 9.68420427690601 | 0.618 |
| 7.342102138453005 | 5.309 |
| 6.171051069226502 | 7.655 |
| 3.085525534613251 | 3.827 |
| 1.5427627673066255 | 1.914 |
| 5.771381383653313 | 0.957 |
| 5.385690691826657 | 5.478 |
| 7.692845345913328 | 2.739 |
| 8.846422672956663 | 1.37 |
| 4.423211336478332 | 0.685 |
| 7.211605668239166 | 0.342 |
| 8.605802834119583 | 0.171 |
| 6.8029014170597915 | 5.086 |
| 3.4014507085298957 | 2.543 |
| 1.7007253542649479 | 1.271 |
| 0.8503626771324739 | 0.636 |
| 5.4251813385662375 | 0.318 |
| 5.212590669283118 | 5.159 |
| 7.606295334641559 | 2.579 |
| 6.303147667320779 | 6.29 |
| 3.1515738336603896 | 3.145 |
| 6.575786916830195 | 1.572 |
| 3.2878934584150974 | 0.786 |
| 1.6439467292075487 | 0.393 |
| 5.821973364603775 | 0.197 |
| 2.9109866823018873 | 0.098 |
| 3.9554933411509436 | 5.049 |
| 6.977746670575472 | 2.525 |
| 3.488873335287736 | 1.262 |
| 1.744436667643868 | 0.631 |
| 5.872218333821934 | 0.316 |
| 5.436109166910967 | 5.158 |
| 5.2180545834554835 | 7.579 |
| 5.109027291727742 | 8.789 |
| 5.054513645863871 | 9.395 |
| 5.027256822931935 | 9.697 |
| 2.5136284114659677 | 4.849 |
| 3.756814205732984 | 7.424 |
| 1.878407102866492 | 3.712 |
| 3.4392035514332457 | 6.856 |
| 4.219601775716622 | 8.428 |
| 2.109800887858311 | 4.214 |
| 6.054900443929156 | 2.107 |
| 8.027450221964578 | 1.054 |
| 6.513725110982289 | 5.527 |
| 8.256862555491145 | 2.763 |
| 4.128431277745572 | 1.382 |
| 2.064215638872786 | 0.691 |
| 6.032107819436392 | 0.345 |
| 8.016053909718195 | 0.173 |
| 6.508026954859098 | 5.086 |
| 8.254013477429549 | 2.543 |
| 6.627006738714774 | 6.272 |
| 3.313503369357387 | 3.136 |
| 1.6567516846786936 | 1.568 |
| 5.828375842339346 | 0.784 |
| 7.914187921169673 | 0.392 |
| 8.957093960584837 | 0.196 |
| 6.9785469802924185 | 5.098 |
| 5.989273490146209 | 7.549 |
| 2.9946367450731044 | 3.774 |
| 6.497318372536553 | 1.887 |
| 8.248659186268277 | 0.944 |
| 9.124329593134139 | 0.472 |
| 7.062164796567069 | 5.236 |
| 8.531082398283534 | 2.618 |
| 4.265541199141767 | 1.309 |
| 2.1327705995708834 | 0.654 |
| 1.0663852997854417 | 0.327 |
| 5.533192649892721 | 0.164 |
| 5.26659632494636 | 5.082 |
| 5.13329816247318 | 7.541 |
| 5.06664908123659 | 8.77 |
| 2.533324540618295 | 4.385 |
| 6.266662270309148 | 2.193 |
| 8.133331135154574 | 1.096 |
| 4.066665567577287 | 0.548 |
| 7.0333327837886435 | 0.274 |
| 6.016666391894322 | 5.137 |
| 5.508333195947161 | 7.569 |
| 2.7541665979735805 | 3.784 |
| 6.37708329898679 | 1.892 |
| 8.188541649493395 | 0.946 |
| 4.0942708247466975 | 0.473 |
| 7.047135412373349 | 0.237 |
| 3.5235677061866744 | 0.118 |
| 4.261783853093338 | 5.059 |
| 2.130891926546669 | 2.53 |
| 6.065445963273334 | 1.265 |
| 5.532722981636667 | 5.632 |
| 7.766361490818333 | 2.816 |
| 8.883180745409167 | 1.408 |
| 4.441590372704583 | 0.704 |
| 2.2207951863522917 | 0.352 |
| 6.110397593176145 | 0.176 |
| 3.0551987965880727 | 0.088 |
| 4.027599398294036 | 5.044 |
| 7.013799699147018 | 2.522 |
| 8.506899849573509 | 1.261 |
| 4.2534499247867545 | 0.631 |
| 4.626724962393377 | 5.315 |
| 4.813362481196688 | 7.658 |
| 4.906681240598344 | 8.829 |
| 4.953340620299172 | 9.414 |
| 4.976670310149586 | 9.707 |
| 2.488335155074793 | 4.854 |
| 3.7441675775373966 | 7.427 |
| 1.8720837887686983 | 3.713 |
| 0.9360418943843491 | 1.857 |
| 5.468020947192175 | 0.928 |
| 5.234010473596087 | 5.464 |
| 2.6170052367980436 | 2.732 |
| 6.308502618399022 | 1.366 |
| 8.15425130919951 | 0.683 |
| 6.577125654599755 | 5.342 |
| 3.2885628272998777 | 2.671 |
| 4.144281413649939 | 6.335 |
| 7.072140706824969 | 3.168 |
| 8.536070353412484 | 1.584 |
| 4.268035176706242 | 0.792 |
| 7.134017588353121 | 0.396 |
| 8.56700879417656 | 0.198 |
| 6.78350439708828 | 5.099 |
| 5.89175219854414 | 7.549 |
| 5.44587609927207 | 8.775 |
| 7.722938049636035 | 4.387 |
| 8.861469024818017 | 2.194 |
| 6.930734512409009 | 6.097 |
| 8.465367256204505 | 3.048 |
| 6.732683628102253 | 6.524 |
| 5.866341814051126 | 8.262 |
| 2.933170907025563 | 4.131 |
| 3.9665854535127814 | 7.066 |
| 6.983292726756391 | 3.533 |
| 3.4916463633781953 | 1.766 |
| 6.745823181689097 | 0.883 |
| 5.872911590844549 | 5.442 |
| 2.9364557954222743 | 2.721 |
| 1.4682278977111372 | 1.36 |
| 0.7341139488555686 | 0.68 |
| 0.3670569744277843 | 0.34 |
| 0.18352848721389214 | 0.17 |
| 5.091764243606947 | 0.085 |
| 7.545882121803473 | 0.043 |
| 3.7729410609017364 | 0.021 |
| 6.886470530450868 | 0.011 |
| 3.443235265225434 | 0.005 |
| 4.221617632612717 | 5.003 |
| 7.110808816306358 | 2.501 |
| 8.55540440815318 | 1.251 |
| 6.77770220407659 | 5.625 |
| 3.388851102038295 | 2.813 |
| 1.6944255510191475 | 1.406 |
| 0.8472127755095737 | 0.703 |
| 2.923606387754787 | 5.352 |
| 3.9618031938773934 | 7.676 |
| 1.9809015969386967 | 3.838 |
| 0.9904507984693484 | 1.919 |
| 0.4952253992346742 | 0.959 |
| 0.2476126996173371 | 0.48 |
| 0.12380634980866854 | 0.24 |
| 0.06190317490433427 | 0.12 |
| 0.030951587452167136 | 0.06 |
| 5.015475793726083 | 0.03 |
| 2.5077378968630417 | 0.015 |
| 3.7538689484315206 | 5.007 |
| 6.87693447421576 | 2.504 |
| 5.93846723710788 | 6.252 |
| 2.96923361855394 | 3.126 |
| 1.48461680927697 | 1.563 |
| 0.742308404638485 | 0.781 |
| 0.3711542023192425 | 0.391 |
| 0.18557710115962125 | 0.195 |
| 2.5927885505798107 | 5.098 |
| 6.296394275289906 | 2.549 |
| 8.148197137644953 | 1.274 |
| 9.074098568822476 | 0.637 |
| 9.53704928441124 | 0.319 |
| 7.26852464220562 | 5.159 |
| 6.13426232110281 | 7.58 |
| 3.067131160551405 | 3.79 |
| 1.5335655802757024 | 1.895 |
| 3.2667827901378512 | 5.947 |
| 4.133391395068926 | 7.974 |
| 4.566695697534463 | 8.987 |
| 7.283347848767232 | 4.493 |
| 8.641673924383616 | 2.247 |
| 6.820836962191808 | 6.123 |
| 8.410418481095904 | 3.062 |
| 4.205209240547952 | 1.531 |
| 4.602604620273976 | 5.765 |
| 4.801302310136988 | 7.883 |
| 4.900651155068494 | 8.941 |
| 7.450325577534247 | 4.471 |
| 6.225162788767124 | 7.235 |
| 8.112581394383561 | 3.618 |
| 4.0562906971917805 | 1.809 |
| 4.52814534859589 | 5.904 |
| 4.764072674297945 | 7.952 |
| 7.382036337148973 | 3.976 |
| 6.1910181685744865 | 6.988 |
| 5.595509084287244 | 8.494 |
| 7.797754542143622 | 4.247 |
| 6.398877271071811 | 7.124 |
| 8.199438635535905 | 3.562 |
| 9.099719317767953 | 1.781 |
| 4.549859658883976 | 0.89 |
| 2.274929829441988 | 0.445 |
| 1.137464914720994 | 0.223 |
| 3.068732457360497 | 5.111 |
| 1.5343662286802484 | 2.556 |
| 3.267183114340124 | 6.278 |
| 1.633591557170062 | 3.139 |
| 3.316795778585031 | 6.569 |
| 4.158397889292516 | 8.285 |
| 7.079198944646258 | 4.142 |
| 3.539599472323129 | 2.071 |
| 4.2697997361615645 | 6.036 |
| 4.634899868080782 | 8.018 |
| 2.317449934040391 | 4.009 |
| 3.658724967020196 | 7.004 |
| 1.829362483510098 | 3.502 |
| 3.4146812417550487 | 6.751 |
| 1.7073406208775244 | 3.376 |
| 0.8536703104387622 | 1.688 |
| 5.426835155219381 | 0.844 |
| 5.2134175776096905 | 5.422 |
| 2.6067087888048452 | 2.711 |
| 3.8033543944024224 | 6.355 |
| 4.401677197201211 | 8.178 |
| 4.700838598600606 | 9.089 |
| 2.350419299300303 | 4.544 |
| 3.675209649650151 | 7.272 |
| 4.337604824825076 | 8.636 |
| 2.168802412412538 | 4.318 |
| 6.08440120620627 | 2.159 |
| 5.542200603103135 | 6.08 |
| 5.271100301551567 | 8.04 |
| 5.135550150775783 | 9.02 |
| 7.567775075387892 | 4.51 |
| 8.783887537693946 | 2.255 |
| 4.391943768846973 | 1.127 |
| 4.695971884423487 | 5.564 |
| 4.847985942211743 | 7.782 |
| 4.923992971105871 | 8.891 |
| 7.461996485552936 | 4.445 |
| 6.230998242776468 | 7.223 |
| 8.115499121388234 | 3.611 |
| 4.057749560694117 | 1.806 |
| 7.028874780347058 | 0.903 |
| 6.014437390173529 | 5.451 |
| 3.0072186950867645 | 2.726 |
| 1.5036093475433823 | 1.363 |
| 0.7518046737716911 | 0.681 |
| 5.375902336885845 | 0.341 |
| 7.687951168442923 | 0.17 |
| 3.8439755842214614 | 0.085 |
| 4.4219877921107305 | 5.043 |
| 4.710993896055365 | 7.521 |
| 2.3554969480276826 | 3.761 |
| 6.177748474013841 | 1.88 |
| 8.08887423700692 | 0.94 |
| 9.04443711850346 | 0.47 |
| 4.52221855925173 | 0.235 |
| 7.261109279625865 | 0.118 |
| 3.6305546398129325 | 0.059 |
| 6.815277319906466 | 0.029 |
| 8.407638659953232 | 0.015 |
| 9.203819329976616 | 0.007 |
| 9.601909664988309 | 0.004 |
| 7.3009548324941544 | 5.002 |
| 6.150477416247077 | 7.501 |
| 5.575238708123539 | 8.75 |
| 7.7876193540617695 | 4.375 |
| 3.8938096770308848 | 2.188 |
| 6.946904838515442 | 1.094 |
| 3.473452419257721 | 0.547 |
| 4.236726209628861 | 5.273 |
| 4.6183631048144305 | 7.637 |
| 2.3091815524072152 | 3.818 |
| 3.654590776203608 | 6.909 |
| 6.827295388101804 | 3.455 |
| 3.413647694050902 | 1.727 |
| 6.706823847025451 | 0.864 |
| 5.853411923512725 | 5.432 |
| 2.9267059617563627 | 2.716 |
| 6.463352980878181 | 1.358 |
| 5.73167649043909 | 5.679 |
| 2.865838245219545 | 2.839 |
| 6.432919122609773 | 1.42 |
| 5.7164595613048865 | 5.71 |
| 2.8582297806524433 | 2.855 |
| 3.929114890326222 | 6.427 |
| 1.964557445163111 | 3.214 |
| 5.9822787225815555 | 1.607 |
| 5.491139361290777 | 5.803 |
| 5.245569680645389 | 7.902 |
| 2.6227848403226943 | 3.951 |
| 6.311392420161347 | 1.975 |
| 3.1556962100806736 | 0.988 |
| 1.5778481050403368 | 0.494 |
| 5.788924052520168 | 0.247 |
| 7.894462026260085 | 0.123 |
| 8.947231013130043 | 0.062 |
| 4.473615506565022 | 0.031 |
| 7.236807753282511 | 0.015 |
| 6.118403876641255 | 5.008 |
| 8.059201938320628 | 2.504 |
| 4.029600969160314 | 1.252 |
| 7.014800484580157 | 0.626 |
| 8.507400242290078 | 0.313 |
| 4.253700121145039 | 0.156 |
| 2.1268500605725196 | 0.078 |
| 6.063425030286259 | 0.039 |
| 3.0317125151431297 | 0.02 |
| 6.515856257571565 | 0.01 |
| 8.257928128785782 | 0.005 |
| 9.12896406439289 | 0.002 |
| 4.564482032196445 | 0.001 |
| 2.2822410160982227 | 0.001 |
| 1.1411205080491114 | 0 |
| 3.0705602540245556 | 5 |
| 1.5352801270122778 | 2.5 |
| 0.7676400635061389 | 1.25 |
| 2.8838200317530696 | 5.625 |
| 1.4419100158765348 | 2.813 |
| 0.7209550079382674 | 1.406 |
| 5.360477503969134 | 0.703 |
| 5.180238751984567 | 5.352 |
| 2.5901193759922836 | 2.676 |
| 3.795059687996142 | 6.338 |
| 6.897529843998071 | 3.169 |
| 5.948764921999036 | 6.584 |
| 7.974382460999518 | 3.292 |
| 3.987191230499759 | 1.646 |
| 4.4935956152498795 | 5.823 |
| 2.2467978076249397 | 2.912 |
| 3.62339890381247 | 6.456 |
| 1.811699451906235 | 3.228 |
| 3.4058497259531175 | 6.614 |
| 4.202924862976559 | 8.307 |
| 2.1014624314882795 | 4.153 |
| 1.0507312157441397 | 2.077 |
| 3.02536560787207 | 6.038 |
| 1.512682803936035 | 3.019 |
| 0.7563414019680175 | 1.51 |
| 0.37817070098400873 | 0.755 |
| 2.6890853504920047 | 5.377 |
| 3.8445426752460024 | 7.689 |
| 4.422271337623001 | 8.844 |
| 4.711135668811501 | 9.422 |
| 2.3555678344057505 | 4.711 |
| 3.6777839172028752 | 7.356 |
| 4.338891958601438 | 8.678 |
| 2.169445979300719 | 4.339 |
| 1.0847229896503594 | 2.169 |
| 5.54236149482518 | 1.085 |
| 5.27118074741259 | 5.542 |
| 5.135590373706295 | 7.771 |
| 7.5677951868531474 | 3.886 |
| 6.283897593426573 | 6.943 |
| 3.1419487967132866 | 3.471 |
| 4.070974398356643 | 6.736 |
| 7.035487199178322 | 3.368 |
| 6.017743599589161 | 6.684 |
| 8.00887179979458 | 3.342 |
| 4.00443589989729 | 1.671 |
| 7.002217949948645 | 0.835 |
| 8.501108974974322 | 0.418 |
| 9.250554487487161 | 0.209 |
| 9.62527724374358 | 0.104 |
| 9.812638621871791 | 0.052 |
| 7.406319310935896 | 5.026 |
| 3.703159655467948 | 2.513 |
| 1.851579827733974 | 1.257 |
| 3.425789913866987 | 5.628 |
| 6.712894956933493 | 2.814 |
| 5.856447478466746 | 6.407 |
| 5.428223739233373 | 8.204 |
| 2.7141118696166866 | 4.102 |
| 1.3570559348083433 | 2.051 |
| 0.6785279674041717 | 1.025 |
| 5.339263983702086 | 0.513 |
| 7.669631991851043 | 0.256 |
| 3.8348159959255215 | 0.128 |
| 1.9174079979627607 | 0.064 |
| 5.958703998981381 | 0.032 |
| 7.9793519994906905 | 0.016 |
| 3.9896759997453453 | 0.008 |
| 4.494837999872672 | 5.004 |
| 4.747418999936336 | 7.502 |
| 4.873709499968168 | 8.751 |
| 7.436854749984084 | 4.376 |
| 8.718427374992043 | 2.188 |
| 4.3592136874960214 | 1.094 |
| 2.1796068437480107 | 0.547 |
| 6.089803421874006 | 0.273 |
| 8.044901710937003 | 0.137 |
| 6.5224508554685015 | 5.068 |
| 8.261225427734251 | 2.534 |
| 4.130612713867126 | 1.267 |
| 2.065306356933563 | 0.634 |
| 1.0326531784667814 | 0.317 |
| 5.516326589233391 | 0.158 |
| 7.758163294616695 | 0.079 |
| 3.8790816473083476 | 0.04 |
| 6.939540823654173 | 0.02 |
| 5.969770411827087 | 5.01 |
| 7.984885205913543 | 2.505 |
| 8.992442602956771 | 1.252 |
| 6.996221301478386 | 5.626 |
| 8.498110650739193 | 2.813 |
| 4.249055325369596 | 1.407 |
| 7.124527662684798 | 0.703 |
| 6.062263831342399 | 5.352 |
| 3.0311319156711996 | 2.676 |
| 1.5155659578355998 | 1.338 |
| 5.7577829789178 | 0.669 |
| 5.3788914894588995 | 5.334 |
| 2.6894457447294497 | 2.667 |
| 1.3447228723647249 | 1.334 |
| 3.1723614361823627 | 5.667 |
| 4.086180718091182 | 7.833 |
| 2.043090359045591 | 3.917 |
| 6.021545179522795 | 1.958 |
| 3.0107725897613977 | 0.979 |
| 4.005386294880699 | 5.49 |
| 4.5026931474403495 | 7.745 |
| 2.2513465737201748 | 3.872 |
| 6.125673286860087 | 1.936 |
| 3.0628366434300434 | 0.968 |
| 6.531418321715021 | 0.484 |
| 8.265709160857512 | 0.242 |
| 6.632854580428756 | 5.121 |
| 3.316427290214378 | 2.561 |
| 1.658213645107189 | 1.28 |
| 3.3291068225535945 | 5.64 |
| 4.164553411276797 | 7.82 |
| 2.0822767056383986 | 3.91 |
| 1.0411383528191993 | 1.955 |
| 5.5205691764096 | 0.978 |
| 7.7602845882048 | 0.489 |
| 6.3801422941024 | 5.244 |
| 8.1900711470512 | 2.622 |
| 4.0950355735256 | 1.311 |
| 4.5475177867628 | 5.656 |
| 7.2737588933814 | 2.828 |
| 3.6368794466907 | 1.414 |
| 1.81843972334535 | 0.707 |
| 0.909219861672675 | 0.353 |
| 2.9546099308363374 | 5.177 |
| 6.477304965418169 | 2.588 |
| 8.238652482709085 | 1.294 |
| 4.119326241354543 | 0.647 |
| 2.0596631206772713 | 0.324 |
| 3.5298315603386357 | 5.162 |
| 6.764915780169318 | 2.581 |
| 3.382457890084659 | 1.29 |
| 1.6912289450423295 | 0.645 |
| 3.3456144725211647 | 5.323 |
| 4.172807236260582 | 7.661 |
| 4.586403618130291 | 8.831 |
| 7.293201809065145 | 4.415 |
| 8.646600904532573 | 2.208 |
| 6.823300452266286 | 6.104 |
| 3.411650226133143 | 3.052 |
| 4.205825113066572 | 6.526 |
| 7.102912556533286 | 3.263 |
| 6.0514562782666435 | 6.631 |
| 3.0257281391333217 | 3.316 |
| 4.01286406956666 | 6.658 |
| 2.00643203478333 | 3.329 |
| 3.503216017391665 | 6.664 |
| 4.2516080086958326 | 8.332 |
| 2.1258040043479163 | 4.166 |
| 6.062902002173958 | 2.083 |
| 5.531451001086979 | 6.042 |
| 7.765725500543489 | 3.021 |
| 8.882862750271745 | 1.51 |
| 4.441431375135872 | 0.755 |
| 7.220715687567936 | 0.378 |
| 8.610357843783968 | 0.189 |
| 4.305178921891984 | 0.094 |
| 7.1525894609459915 | 0.047 |
| 8.576294730472995 | 0.024 |
| 9.288147365236497 | 0.012 |
| 4.644073682618249 | 0.006 |
| 7.322036841309124 | 0.003 |
| 6.161018420654562 | 5.001 |
| 5.580509210327281 | 7.501 |
| 7.790254605163641 | 3.75 |
| 8.89512730258182 | 1.875 |
| 4.44756365129091 | 0.938 |
| 7.223781825645455 | 0.469 |
| 8.611890912822727 | 0.234 |
| 9.305945456411363 | 0.117 |
| 7.152972728205682 | 5.059 |
| 8.576486364102841 | 2.529 |
| 4.288243182051421 | 1.265 |
| 2.1441215910257103 | 0.632 |
| 3.572060795512855 | 5.316 |
| 4.286030397756427 | 7.658 |
| 4.643015198878214 | 8.829 |
| 2.321507599439107 | 4.415 |
| 1.1607537997195534 | 2.207 |
| 3.0803768998597767 | 6.104 |
| 4.040188449929889 | 8.052 |
| 7.020094224964945 | 4.026 |
| 8.510047112482471 | 2.013 |
| 4.255023556241236 | 1.006 |
| 7.127511778120618 | 0.503 |
| 8.563755889060308 | 0.252 |
| 9.281877944530155 | 0.126 |
| 9.640938972265078 | 0.063 |
| 7.320469486132539 | 5.031 |
| 3.6602347430662694 | 2.516 |
| 4.3301173715331345 | 6.258 |
| 2.1650586857665672 | 3.129 |
| 6.082529342883284 | 1.564 |
| 3.041264671441642 | 0.782 |
| 1.520632335720821 | 0.391 |
| 5.7603161678604105 | 0.196 |
| 2.8801580839302052 | 0.098 |
| 1.4400790419651026 | 0.049 |
| 5.720039520982551 | 0.024 |
| 7.860019760491276 | 0.012 |
| 6.430009880245638 | 5.006 |
| 3.215004940122819 | 2.503 |
| 4.10750247006141 | 6.252 |
| 7.053751235030704 | 3.126 |
| 3.526875617515352 | 1.563 |
| 1.763437808757676 | 0.781 |
| 3.381718904378838 | 5.391 |
| 6.690859452189419 | 2.695 |
| 8.345429726094709 | 1.348 |
| 9.172714863047354 | 0.674 |
| 4.586357431523677 | 0.337 |
| 4.793178715761838 | 5.168 |
| 4.896589357880919 | 7.584 |
| 2.4482946789404596 | 3.792 |
| 1.2241473394702298 | 1.896 |
| 5.612073669735115 | 0.948 |
| 5.306036834867557 | 5.474 |
| 5.1530184174337785 | 7.737 |
| 2.5765092087168893 | 3.869 |
| 6.288254604358444 | 1.934 |
| 8.144127302179221 | 0.967 |
| 4.072063651089611 | 0.484 |
| 7.036031825544805 | 0.242 |
| 3.5180159127724027 | 0.121 |
| 1.7590079563862013 | 0.06 |
| 3.3795039781931004 | 5.03 |
| 4.18975198909655 | 7.515 |
| 7.094875994548275 | 3.758 |
| 8.547437997274137 | 1.879 |
| 9.273718998637069 | 0.939 |
| 9.636859499318534 | 0.47 |
| 4.818429749659267 | 0.235 |
| 2.4092148748296336 | 0.117 |
| 3.7046074374148166 | 5.059 |
| 4.352303718707408 | 7.529 |
| 4.676151859353704 | 8.765 |
| 4.838075929676852 | 9.382 |
| 2.419037964838426 | 4.691 |
| 3.7095189824192127 | 7.346 |
| 4.354759491209606 | 8.673 |
| 4.677379745604803 | 9.336 |
| 7.3386898728024015 | 4.668 |
| 6.169344936401201 | 7.334 |
| 5.5846724682006 | 8.667 |
| 2.7923362341003 | 4.334 |
| 6.39616811705015 | 2.167 |
| 8.198084058525076 | 1.083 |
| 6.599042029262538 | 5.542 |
| 3.299521014631269 | 2.771 |
| 4.1497605073156345 | 6.385 |
| 4.574880253657817 | 8.193 |
| 2.2874401268289084 | 4.096 |
| 3.643720063414454 | 7.048 |
| 6.821860031707227 | 3.524 |
| 8.410930015853614 | 1.762 |
| 9.205465007926808 | 0.881 |
| 9.602732503963404 | 0.441 |
| 7.301366251981702 | 5.22 |
| 8.65068312599085 | 2.61 |
| 4.325341562995425 | 1.305 |
| 4.662670781497713 | 5.653 |
| 7.3313353907488565 | 2.826 |
| 6.165667695374428 | 6.413 |
| 8.082833847687214 | 3.207 |
| 6.541416923843607 | 6.603 |
| 3.2707084619218034 | 3.302 |
| 4.1353542309609015 | 6.651 |
| 4.567677115480451 | 8.325 |
| 7.283838557740225 | 4.163 |
| 6.1419192788701125 | 7.081 |
| 8.070959639435056 | 3.541 |
| 6.535479819717528 | 6.77 |
| 8.267739909858765 | 3.385 |
| 6.6338699549293825 | 6.693 |
| 3.3169349774646912 | 3.346 |
| 4.158467488732345 | 6.673 |
| 2.0792337443661726 | 3.337 |
| 3.5396168721830863 | 6.668 |
| 1.7698084360915431 | 3.334 |
| 5.884904218045772 | 1.667 |
| 7.942452109022886 | 0.834 |
| 8.971226054511444 | 0.417 |
| 9.485613027255722 | 0.208 |
| 7.242806513627861 | 5.104 |
| 3.6214032568139305 | 2.552 |
| 4.3107016284069655 | 6.276 |
| 7.155350814203483 | 3.138 |
| 3.5776754071017414 | 1.569 |
| 6.78883770355087 | 0.785 |
| 3.394418851775435 | 0.392 |
| 6.697209425887717 | 0.196 |
| 8.348604712943859 | 0.098 |
| 9.17430235647193 | 0.049 |
| 4.587151178235965 | 0.025 |
| 4.7935755891179825 | 5.012 |
| 4.896787794558991 | 7.506 |
| 2.4483938972794954 | 3.753 |
| 6.224196948639747 | 1.877 |
| 5.612098474319874 | 5.938 |
| 2.806049237159937 | 2.969 |
| 1.4030246185799684 | 1.485 |
| 3.201512309289984 | 5.742 |
| 4.100756154644992 | 7.871 |
| 7.050378077322496 | 3.936 |
| 6.025189038661248 | 6.968 |
| 5.512594519330624 | 8.484 |
| 7.7562972596653115 | 4.242 |
| 6.378148629832656 | 7.121 |
| 3.189074314916328 | 3.56 |
| 1.594537157458164 | 1.78 |
| 5.797268578729081 | 0.89 |
| 7.898634289364541 | 0.445 |
| 6.44931714468227 | 5.223 |
| 3.224658572341135 | 2.611 |
| 6.612329286170567 | 1.306 |
| 8.306164643085284 | 0.653 |
| 6.653082321542642 | 5.326 |
| 8.32654116077132 | 2.663 |
| 9.16327058038566 | 1.332 |
| 7.08163529019283 | 5.666 |
| 8.540817645096414 | 2.833 |
| 4.270408822548207 | 1.416 |
| 7.1352044112741035 | 0.708 |
| 6.067602205637051 | 5.354 |
| 8.033801102818526 | 2.677 |
| 9.016900551409263 | 1.339 |
| 4.508450275704631 | 0.669 |
| 4.754225137852316 | 5.335 |
| 2.377112568926158 | 2.667 |
| 6.188556284463079 | 1.334 |
| 5.5942781422315395 | 5.667 |
| 7.79713907111577 | 2.833 |
| 3.898569535557885 | 1.417 |
| 4.449284767778942 | 5.708 |
| 4.724642383889471 | 7.854 |
| 4.862321191944735 | 8.927 |
| 7.431160595972368 | 4.464 |
| 3.715580297986184 | 2.232 |
| 4.357790148993092 | 6.116 |
| 2.178895074496546 | 3.058 |
| 3.5894475372482733 | 6.529 |
| 1.7947237686241366 | 3.264 |
| 5.897361884312069 | 1.632 |
| 5.4486809421560345 | 5.816 |
| 5.224340471078017 | 7.908 |
| 7.612170235539009 | 3.954 |
| 3.8060851177695043 | 1.977 |
| 6.903042558884753 | 0.989 |
| 3.4515212794423764 | 0.494 |
| 6.725760639721188 | 0.247 |
| 5.862880319860594 | 5.124 |
| 7.931440159930297 | 2.562 |
| 3.9657200799651484 | 1.281 |
| 6.982860039982574 | 0.64 |
| 5.991430019991287 | 5.32 |
| 7.995715009995644 | 2.66 |
| 3.997857504997822 | 1.33 |
| 6.9989287524989106 | 0.665 |
| 5.999464376249455 | 5.333 |
| 5.499732188124728 | 7.666 |
| 7.749866094062364 | 3.833 |
| 8.874933047031181 | 1.917 |
| 4.437466523515591 | 0.958 |
| 2.2187332617577953 | 0.479 |
| 3.6093666308788976 | 5.24 |
| 6.8046833154394495 | 2.62 |
| 8.402341657719724 | 1.31 |
| 4.201170828859862 | 0.655 |
| 4.600585414429931 | 5.327 |
| 4.8002927072149655 | 7.664 |
| 7.400146353607482 | 3.832 |
| 3.700073176803741 | 1.916 |
| 1.8500365884018706 | 0.958 |
| 0.9250182942009353 | 0.479 |
| 2.9625091471004676 | 5.239 |
| 1.4812545735502338 | 2.62 |
| 5.7406272867751165 | 1.31 |
| 2.8703136433875582 | 0.655 |
| 3.935156821693779 | 5.327 |
| 6.9675784108468894 | 2.664 |
| 5.983789205423445 | 6.332 |
| 5.491894602711723 | 8.166 |
| 2.7459473013558613 | 4.083 |
| 3.8729736506779306 | 7.041 |
| 6.9364868253389655 | 3.521 |
| 8.468243412669484 | 1.76 |
| 4.234121706334742 | 0.88 |
| 2.117060853167371 | 0.44 |
| 1.0585304265836855 | 0.22 |
| 3.0292652132918425 | 5.11 |
| 6.514632606645922 | 2.555 |
| 3.257316303322961 | 1.278 |
| 6.62865815166148 | 0.639 |
| 3.31432907583074 | 0.319 |
| 6.657164537915371 | 0.16 |
| 5.828582268957685 | 5.08 |
| 7.914291134478843 | 2.54 |
| 6.457145567239421 | 6.27 |
| 3.2285727836197107 | 3.135 |
| 6.614286391809856 | 1.567 |
| 5.807143195904928 | 5.784 |
| 2.903571597952464 | 2.892 |
| 3.951785798976232 | 6.446 |
| 6.975892899488116 | 3.223 |
| 8.487946449744058 | 1.611 |
| 4.243973224872029 | 0.806 |
| 2.1219866124360145 | 0.403 |
| 6.060993306218007 | 0.201 |
| 3.0304966531090036 | 0.101 |
| 6.515248326554502 | 0.05 |
| 5.757624163277251 | 5.025 |
| 7.878812081638626 | 2.513 |
| 8.939406040819312 | 1.256 |
| 4.469703020409656 | 0.628 |
| 4.7348515102048285 | 5.314 |
| 2.3674257551024143 | 2.657 |
| 1.1837128775512071 | 1.329 |
| 5.591856438775604 | 0.664 |
| 7.795928219387802 | 0.332 |
| 8.897964109693902 | 0.166 |
| 6.948982054846951 | 5.083 |
| 5.9744910274234755 | 7.542 |
| 7.987245513711738 | 3.771 |
| 6.493622756855869 | 6.885 |
| 3.2468113784279344 | 3.443 |
| 1.6234056892139672 | 1.721 |
| 0.8117028446069836 | 0.861 |
| 5.405851422303492 | 0.43 |
| 2.702925711151746 | 0.215 |
| 1.351462855575873 | 0.108 |
| 3.1757314277879365 | 5.054 |
| 6.587865713893969 | 2.527 |
| 5.793932856946984 | 6.263 |
| 2.896966428473492 | 3.132 |
| 6.448483214236746 | 1.566 |
| 8.224241607118373 | 0.783 |
| 6.612120803559186 | 5.391 |
| 5.806060401779593 | 7.696 |
| 5.403030200889797 | 8.848 |
| 2.7015151004448983 | 4.424 |
| 3.850757550222449 | 7.212 |
| 6.925378775111225 | 3.606 |
| 3.4626893875556126 | 1.803 |
| 4.231344693777807 | 5.901 |
| 2.1156723468889034 | 2.951 |
| 3.5578361734444517 | 6.475 |
| 1.7789180867222258 | 3.238 |
| 0.8894590433611129 | 1.619 |
| 5.444729521680557 | 0.809 |
| 2.7223647608402786 | 0.405 |
| 3.8611823804201393 | 5.202 |
| 6.93059119021007 | 2.601 |
| 5.965295595105035 | 6.301 |
| 7.982647797552517 | 3.15 |
| 8.991323898776258 | 1.575 |
| 4.495661949388129 | 0.788 |
| 4.747830974694065 | 5.394 |
| 7.373915487347032 | 2.697 |
| 6.186957743673516 | 6.348 |
| 5.5934788718367585 | 8.174 |
| 2.7967394359183793 | 4.087 |
| 1.3983697179591896 | 2.044 |
| 3.199184858979595 | 6.022 |
| 4.099592429489798 | 8.011 |
| 7.049796214744899 | 4.005 |
| 8.524898107372449 | 2.003 |
| 9.262449053686225 | 1.001 |
| 7.131224526843113 | 5.501 |
| 8.565612263421556 | 2.75 |
| 9.282806131710778 | 1.375 |
| 9.641403065855389 | 0.688 |
| 9.820701532927695 | 0.344 |
| 7.410350766463847 | 5.172 |
| 6.205175383231923 | 7.586 |
| 8.102587691615962 | 3.793 |
| 6.551293845807981 | 6.896 |
| 8.275646922903992 | 3.448 |
| 6.637823461451996 | 6.724 |
| 5.818911730725998 | 8.362 |
| 2.909455865362999 | 4.181 |
| 6.4547279326815 | 2.091 |
| 3.22736396634075 | 1.045 |
| 4.113681983170375 | 5.523 |
| 7.0568409915851875 | 2.761 |
| 3.5284204957925938 | 1.381 |
| 6.7642102478962975 | 0.69 |
| 3.3821051239481488 | 0.345 |
| 6.691052561974074 | 0.173 |
| 8.345526280987038 | 0.086 |
| 9.172763140493519 | 0.043 |
| 9.58638157024676 | 0.022 |
| 7.29319078512338 | 5.011 |
| 3.64659539256169 | 2.505 |
| 6.823297696280845 | 1.253 |
| 8.411648848140423 | 0.626 |
| 9.205824424070212 | 0.313 |
| 9.602912212035106 | 0.157 |
| 7.301456106017553 | 5.078 |
| 3.6507280530087765 | 2.539 |
| 4.3253640265043884 | 6.27 |
| 2.1626820132521942 | 3.135 |
| 1.0813410066260971 | 1.567 |
| 0.5406705033130486 | 0.784 |
| 2.7703352516565243 | 5.392 |
| 6.385167625828262 | 2.696 |
| 5.6925838129141315 | 6.348 |
| 7.846291906457066 | 3.174 |
| 8.923145953228532 | 1.587 |
| 9.461572976614267 | 0.793 |
| 7.2307864883071336 | 5.397 |
| 8.615393244153566 | 2.698 |
| 6.807696622076783 | 6.349 |
| 5.9038483110383915 | 8.175 |
| 5.451924155519196 | 9.087 |
| 5.225962077759598 | 9.544 |
| 7.6129810388797985 | 4.772 |
| 6.306490519439899 | 7.386 |
| 3.1532452597199496 | 3.693 |
| 4.076622629859974 | 6.846 |
| 7.038311314929987 | 3.423 |
| 3.5191556574649936 | 1.712 |
| 1.7595778287324968 | 0.856 |
| 5.879788914366249 | 0.428 |
| 2.9398944571831245 | 0.214 |
| 1.4699472285915622 | 0.107 |
| 5.734973614295781 | 0.053 |
| 2.8674868071478903 | 0.027 |
| 1.4337434035739451 | 0.013 |
| 3.216871701786973 | 5.007 |
| 1.6084358508934864 | 2.503 |
| 5.804217925446744 | 1.252 |
| 5.402108962723371 | 5.626 |
| 7.701054481361686 | 2.813 |
| 3.850527240680843 | 1.406 |
| 4.425263620340422 | 5.703 |
| 4.712631810170211 | 7.852 |
| 4.856315905085106 | 8.926 |
| 4.928157952542553 | 9.463 |
| 2.4640789762712765 | 4.731 |
| 3.732039488135638 | 7.366 |
| 4.366019744067819 | 8.683 |
| 2.1830098720339093 | 4.341 |
| 6.091504936016955 | 2.171 |
| 3.0457524680084775 | 1.085 |
| 6.522876234004238 | 0.543 |
| 3.261438117002119 | 0.271 |
| 6.630719058501059 | 0.136 |
| 5.81535952925053 | 5.068 |
| 5.407679764625264 | 7.534 |
| 7.703839882312632 | 3.767 |
| 3.851919941156316 | 1.883 |
| 1.925959970578158 | 0.942 |
| 3.462979985289079 | 5.471 |
| 4.23148999264454 | 7.735 |
| 7.11574499632227 | 3.868 |
| 3.557872498161135 | 1.934 |
| 1.7789362490805676 | 0.967 |
| 3.389468124540284 | 5.483 |
| 6.6947340622701415 | 2.742 |
| 5.847367031135071 | 6.371 |
| 5.423683515567536 | 8.185 |
| 5.211841757783768 | 9.093 |
| 2.605920878891884 | 4.546 |
| 1.302960439445942 | 2.273 |
| 3.1514802197229708 | 6.137 |
| 1.5757401098614854 | 3.068 |
| 3.2878700549307425 | 6.534 |
| 4.143935027465371 | 8.267 |
| 2.0719675137326856 | 4.134 |
| 1.0359837568663428 | 2.067 |
| 3.0179918784331714 | 6.033 |
| 6.508995939216586 | 3.017 |
| 5.754497969608293 | 6.508 |
| 7.8772489848041465 | 3.254 |
| 8.938624492402074 | 1.627 |
| 6.969312246201037 | 5.814 |
| 5.984656123100518 | 7.907 |
| 5.492328061550259 | 8.953 |
| 7.746164030775129 | 4.477 |
| 3.8730820153875647 | 2.238 |
| 4.436541007693783 | 6.119 |
| 4.718270503846892 | 8.06 |
| 4.859135251923446 | 9.03 |
| 4.929567625961723 | 9.515 |
| 2.4647838129808615 | 4.757 |
| 3.732391906490431 | 7.379 |
| 4.3661959532452155 | 8.689 |
| 4.683097976622608 | 9.345 |
| 7.341548988311304 | 4.672 |
| 8.670774494155651 | 2.336 |
| 6.835387247077826 | 6.168 |
| 5.917693623538913 | 8.084 |
| 7.958846811769456 | 4.042 |
| 8.979423405884727 | 2.021 |
| 4.489711702942364 | 1.011 |
| 4.744855851471182 | 5.505 |
| 7.372427925735591 | 2.753 |
| 8.686213962867797 | 1.376 |
| 9.343106981433898 | 0.688 |
| 4.671553490716949 | 0.344 |
| 7.335776745358475 | 0.172 |
| 6.167888372679237 | 5.086 |
| 8.083944186339618 | 2.543 |
| 4.041972093169809 | 1.272 |
| 2.0209860465849045 | 0.636 |
| 3.5104930232924523 | 5.318 |
| 6.7552465116462255 | 2.659 |
| 8.377623255823114 | 1.329 |
| 4.188811627911557 | 0.665 |
| 2.0944058139557784 | 0.332 |
| 3.547202906977889 | 5.166 |
| 1.7736014534889446 | 2.583 |
| 5.886800726744472 | 1.292 |
| 2.943400363372236 | 0.646 |
| 6.471700181686118 | 0.323 |
| 3.235850090843059 | 0.161 |
| 1.6179250454215295 | 0.081 |
| 0.8089625227107647 | 0.04 |
| 0.40448126135538237 | 0.02 |
| 0.20224063067769119 | 0.01 |
| 0.10112031533884559 | 0.005 |
| 2.550560157669423 | 5.003 |
| 1.2752800788347114 | 2.501 |
| 3.137640039417356 | 6.251 |
| 4.068820019708678 | 8.125 |
| 2.034410009854339 | 4.063 |
| 6.0172050049271695 | 2.031 |
| 3.0086025024635847 | 1.016 |
| 6.504301251231793 | 0.508 |
| 3.2521506256158963 | 0.254 |
| 1.6260753128079481 | 0.127 |
| 0.8130376564039741 | 0.063 |
| 2.906518828201987 | 5.032 |
| 3.9532594141009936 | 7.516 |
| 6.976629707050497 | 3.758 |
| 8.48831485352525 | 1.879 |
| 6.744157426762625 | 5.939 |
| 3.3720787133813124 | 2.97 |
| 4.186039356690657 | 6.485 |
| 7.093019678345328 | 3.242 |
| 8.546509839172664 | 1.621 |
| 6.773254919586332 | 5.811 |
| 5.886627459793166 | 7.905 |
| 7.943313729896583 | 3.953 |
| 6.471656864948292 | 6.976 |
| 5.735828432474146 | 8.488 |
| 2.867914216237073 | 4.244 |
| 1.4339571081185365 | 2.122 |
| 3.216978554059268 | 6.061 |
| 6.6084892770296335 | 3.031 |
| 8.304244638514817 | 1.515 |
| 9.152122319257408 | 0.758 |
| 9.576061159628704 | 0.379 |
| 7.288030579814352 | 5.189 |
| 3.644015289907176 | 2.595 |
| 6.8220076449535885 | 1.297 |
| 5.911003822476794 | 5.649 |
| 5.455501911238397 | 7.824 |
| 5.227750955619198 | 8.912 |
| 2.613875477809599 | 4.456 |
| 3.8069377389047996 | 7.228 |
| 4.4034688694524 | 8.614 |
| 4.7017344347262 | 9.307 |
| 4.8508672173631 | 9.654 |
| 4.92543360868155 | 9.827 |
| 7.462716804340775 | 4.913 |
| 3.7313584021703874 | 2.457 |
| 1.8656792010851937 | 1.228 |
| 3.4328396005425965 | 5.614 |
| 6.716419800271298 | 2.807 |
| 8.358209900135648 | 1.404 |
| 6.679104950067824 | 5.702 |
| 5.839552475033912 | 7.851 |
| 7.919776237516956 | 3.925 |
| 6.459888118758478 | 6.963 |
| 8.229944059379239 | 3.481 |
| 4.1149720296896195 | 1.741 |
| 2.0574860148448098 | 0.87 |
| 6.028743007422404 | 0.435 |
| 3.014371503711202 | 0.218 |
| 6.5071857518556016 | 0.109 |
| 5.753592875927801 | 5.054 |
| 2.8767964379639004 | 2.527 |
| 6.43839821898195 | 1.264 |
| 8.219199109490976 | 0.632 |
| 4.109599554745488 | 0.316 |
| 4.554799777372744 | 5.158 |
| 4.7773998886863716 | 7.579 |
| 2.3886999443431858 | 3.789 |
| 3.694349972171593 | 6.895 |
| 1.8471749860857964 | 3.447 |
| 3.4235874930428984 | 6.724 |
| 4.211793746521449 | 8.362 |
| 4.605896873260725 | 9.181 |
| 2.3029484366303623 | 4.59 |
| 3.6514742183151814 | 7.295 |
| 6.825737109157591 | 3.648 |
| 3.4128685545787953 | 1.824 |
| 6.706434277289398 | 0.912 |
| 3.353217138644699 | 0.456 |
| 4.176608569322349 | 5.228 |
| 4.588304284661175 | 7.614 |
| 7.294152142330587 | 3.807 |
| 3.6470760711652934 | 1.903 |
| 1.8235380355826467 | 0.952 |
| 0.9117690177913234 | 0.476 |
| 5.455884508895662 | 0.238 |
| 2.727942254447831 | 0.119 |
| 3.8639711272239152 | 5.059 |
| 4.431985563611958 | 7.53 |
| 2.215992781805979 | 3.765 |
| 6.10799639090299 | 1.882 |
| 8.053998195451495 | 0.941 |
| 6.5269990977257475 | 5.471 |
| 3.2634995488628737 | 2.735 |
| 4.131749774431437 | 6.368 |
| 2.0658748872157187 | 3.184 |
| 6.032937443607859 | 1.592 |
| 5.51646872180393 | 5.796 |
| 2.758234360901965 | 2.898 |
| 1.3791171804509825 | 1.449 |
| 3.1895585902254915 | 5.724 |
| 4.094779295112746 | 7.862 |
| 2.047389647556373 | 3.931 |
| 3.5236948237781864 | 6.966 |
| 1.7618474118890932 | 3.483 |
| 5.8809237059445465 | 1.741 |
| 2.9404618529722732 | 0.871 |
| 3.9702309264861366 | 5.435 |
| 1.9851154632430683 | 2.718 |
| 5.992557731621534 | 1.359 |
| 5.496278865810767 | 5.679 |
| 2.7481394329053837 | 2.84 |
| 6.374069716452691 | 1.42 |
| 5.687034858226346 | 5.71 |
| 5.343517429113173 | 7.855 |
| 7.671758714556587 | 3.927 |
| 3.8358793572782934 | 1.964 |
| 4.417939678639147 | 5.982 |
| 2.2089698393195736 | 2.991 |
| 3.604484919659787 | 6.495 |
| 4.302242459829893 | 8.248 |
| 7.1511212299149465 | 4.124 |
| 6.075560614957473 | 7.062 |
| 8.037780307478737 | 3.531 |
| 6.518890153739369 | 6.765 |
| 5.759445076869684 | 8.383 |
| 2.879722538434842 | 4.191 |
| 1.439861269217421 | 2.096 |
| 3.21993063460871 | 6.048 |
| 1.609965317304355 | 3.024 |
| 3.3049826586521776 | 6.512 |
| 4.1524913293260886 | 8.256 |
| 4.576245664663045 | 9.128 |
| 4.788122832331522 | 9.564 |
| 2.394061416165761 | 4.782 |
| 3.6970307080828806 | 7.391 |
| 4.3485153540414405 | 8.695 |
| 4.67425767702072 | 9.348 |
| 4.83712883851036 | 9.674 |
| 2.41856441925518 | 4.837 |
| 3.70928220962759 | 7.418 |
| 6.854641104813795 | 3.709 |
| 3.4273205524068975 | 1.855 |
| 6.7136602762034485 | 0.927 |
| 3.3568301381017243 | 0.464 |
| 4.178415069050862 | 5.232 |
| 7.089207534525431 | 2.616 |
| 3.5446037672627155 | 1.308 |
| 4.272301883631358 | 5.654 |
| 4.6361509418156786 | 7.827 |
| 2.3180754709078393 | 3.913 |
| 3.6590377354539196 | 6.957 |
| 4.32951886772696 | 8.478 |
| 4.66475943386348 | 9.239 |
| 4.83237971693174 | 9.62 |
| 7.41618985846587 | 4.81 |
| 3.708094929232935 | 2.405 |
| 4.3540474646164675 | 6.202 |
| 2.1770237323082338 | 3.101 |
| 1.0885118661541169 | 1.551 |
| 5.544255933077058 | 0.775 |
| 2.772127966538529 | 0.388 |
| 6.386063983269265 | 0.194 |
| 5.693031991634633 | 5.097 |
| 7.846515995817317 | 2.548 |
| 6.423257997908658 | 6.274 |
| 3.211628998954329 | 3.137 |
| 4.105814499477164 | 6.569 |
| 4.552907249738582 | 8.284 |
| 2.276453624869291 | 4.142 |
| 3.6382268124346453 | 7.071 |
| 6.819113406217323 | 3.536 |
| 8.409556703108661 | 1.768 |
| 9.204778351554332 | 0.884 |
| 9.602389175777166 | 0.442 |
| 4.801194587888583 | 0.221 |
| 4.900597293944291 | 5.11 |
| 4.950298646972145 | 7.555 |
| 2.4751493234860726 | 3.778 |
| 1.2375746617430363 | 1.889 |
| 5.618787330871518 | 0.944 |
| 5.309393665435759 | 5.472 |
| 5.15469683271788 | 7.736 |
| 5.07734841635894 | 8.868 |
| 5.03867420817947 | 9.434 |
| 7.519337104089735 | 4.717 |
| 6.259668552044868 | 7.359 |
| 8.129834276022434 | 3.679 |
| 4.064917138011217 | 1.84 |
| 2.0324585690056085 | 0.92 |
| 1.0162292845028043 | 0.46 |
| 3.0081146422514022 | 5.23 |
| 1.5040573211257011 | 2.615 |
| 0.7520286605628506 | 1.307 |
| 0.3760143302814253 | 0.654 |
| 2.688007165140713 | 5.327 |
| 6.344003582570357 | 2.663 |
| 8.17200179128518 | 1.332 |
| 9.08600089564259 | 0.666 |
| 4.543000447821295 | 0.333 |
| 7.271500223910648 | 0.166 |
| 8.635750111955325 | 0.083 |
| 6.817875055977662 | 5.042 |
| 5.908937527988831 | 7.521 |
| 2.9544687639944156 | 3.76 |
| 1.4772343819972078 | 1.88 |
| 3.238617190998604 | 5.94 |
| 6.619308595499302 | 2.97 |
| 5.809654297749651 | 6.485 |
| 2.9048271488748254 | 3.243 |
| 1.4524135744374127 | 1.621 |
| 0.7262067872187064 | 0.811 |
| 0.3631033936093532 | 0.405 |
| 2.681551696804677 | 5.203 |
| 3.8407758484023384 | 7.601 |
| 6.920387924201169 | 3.801 |
| 3.4601939621005844 | 1.9 |
| 4.230096981050292 | 5.95 |
| 4.615048490525146 | 7.975 |
| 2.307524245262573 | 3.988 |
| 1.1537621226312864 | 1.994 |
| 5.5768810613156425 | 0.997 |
| 5.288440530657821 | 5.498 |
| 7.644220265328911 | 2.749 |
| 3.8221101326644553 | 1.375 |
| 1.9110550663322277 | 0.687 |
| 3.455527533166114 | 5.344 |
| 6.727763766583057 | 2.672 |
| 3.3638818832915285 | 1.336 |
| 4.181940941645764 | 5.668 |
| 4.590970470822882 | 7.834 |
| 2.295485235411441 | 3.917 |
| 1.1477426177057204 | 1.958 |
| 0.5738713088528602 | 0.979 |
| 2.78693565442643 | 5.49 |
| 1.393467827213215 | 2.745 |
| 0.6967339136066075 | 1.372 |
| 5.348366956803304 | 0.686 |
| 5.174183478401652 | 5.343 |
| 7.587091739200826 | 2.672 |
| 6.293545869600413 | 6.336 |
| 3.1467729348002065 | 3.168 |
| 1.5733864674001032 | 1.584 |
| 0.7866932337000516 | 0.792 |
| 5.393346616850026 | 0.396 |
| 5.196673308425013 | 5.198 |
| 2.5983366542125066 | 2.599 |
| 3.799168327106253 | 6.299 |
| 4.3995841635531265 | 8.15 |
| 2.1997920817765633 | 4.075 |
| 1.0998960408882816 | 2.037 |
| 5.54994802044414 | 1.019 |
| 5.274974010222071 | 5.509 |
| 5.137487005111035 | 7.755 |
| 7.568743502555518 | 3.877 |
| 8.784371751277758 | 1.939 |
| 9.39218587563888 | 0.969 |
| 7.19609293781944 | 5.485 |
| 8.59804646890972 | 2.742 |
| 6.79902323445486 | 6.371 |
| 5.8995116172274304 | 8.186 |
| 5.449755808613715 | 9.093 |
| 7.724877904306858 | 4.546 |
| 3.862438952153429 | 2.273 |
| 1.9312194760767145 | 1.137 |
| 3.4656097380383573 | 5.568 |
| 4.232804869019178 | 7.784 |
| 2.116402434509589 | 3.892 |
| 6.058201217254794 | 1.946 |
| 5.529100608627397 | 5.973 |
| 2.7645503043136985 | 2.987 |
| 1.3822751521568493 | 1.493 |
| 3.1911375760784244 | 5.747 |
| 1.5955687880392122 | 2.873 |
| 0.7977843940196061 | 1.437 |
| 0.39889219700980305 | 0.718 |
| 0.19944609850490153 | 0.359 |
| 0.09972304925245076 | 0.18 |
| 5.049861524626226 | 0.09 |
| 5.024930762313113 | 5.045 |
| 7.512465381156557 | 2.522 |
| 6.256232690578278 | 6.261 |
| 3.128116345289139 | 3.131 |
| 1.5640581726445695 | 1.565 |
| 5.782029086322284 | 0.783 |
| 2.891014543161142 | 0.391 |
| 1.445507271580571 | 0.196 |
| 3.2227536357902853 | 5.098 |
| 1.6113768178951426 | 2.549 |
| 0.8056884089475713 | 1.274 |
| 5.402844204473785 | 0.637 |
| 5.201422102236893 | 5.319 |
| 2.6007110511184464 | 2.659 |
| 1.3003555255592232 | 1.33 |
| 3.1501777627796113 | 5.665 |
| 6.575088881389806 | 2.832 |
| 5.787544440694903 | 6.416 |
| 2.8937722203474516 | 3.208 |
| 6.446886110173725 | 1.604 |
| 3.2234430550868627 | 0.802 |
| 6.611721527543431 | 0.401 |
| 5.805860763771715 | 5.201 |
| 5.402930381885858 | 7.6 |
| 5.201465190942929 | 8.8 |
| 5.100732595471465 | 9.4 |
| 5.050366297735732 | 9.7 |
| 5.025183148867866 | 9.85 |
| 2.512591574433933 | 4.925 |
| 1.2562957872169664 | 2.463 |
| 3.1281478936084834 | 6.231 |
| 4.064073946804242 | 8.116 |
| 7.032036973402121 | 4.058 |
| 6.016018486701061 | 7.029 |
| 5.50800924335053 | 8.514 |
| 2.754004621675265 | 4.257 |
| 1.3770023108376326 | 2.129 |
| 0.6885011554188163 | 1.064 |
| 2.844250577709408 | 5.532 |
| 3.922125288854704 | 7.766 |
| 1.961062644427352 | 3.883 |
| 0.980531322213676 | 1.942 |
| 2.9902656611068377 | 5.971 |
| 1.4951328305534188 | 2.985 |
| 5.747566415276709 | 1.493 |
| 2.8737832076383545 | 0.746 |
| 3.936891603819177 | 5.373 |
| 1.9684458019095885 | 2.687 |
| 5.984222900954794 | 1.343 |
| 7.992111450477397 | 0.672 |
| 8.996055725238698 | 0.336 |
| 9.498027862619349 | 0.168 |
| 9.749013931309674 | 0.084 |
| 4.874506965654837 | 0.042 |
| 2.4372534828274186 | 0.021 |
| 6.2186267414137095 | 0.01 |
| 5.609313370706855 | 5.005 |
| 5.304656685353427 | 7.503 |
| 7.6523283426767135 | 3.751 |
| 6.326164171338357 | 6.876 |
| 8.163082085669178 | 3.438 |
| 9.081541042834589 | 1.719 |
| 4.540770521417294 | 0.859 |
| 4.770385260708647 | 5.43 |
| 4.885192630354323 | 7.715 |
| 2.4425963151771617 | 3.857 |
| 1.2212981575885808 | 1.929 |
| 0.6106490787942904 | 0.964 |
| 2.8053245393971453 | 5.482 |
| 6.402662269698572 | 2.741 |
| 8.201331134849287 | 1.371 |
| 6.6006655674246435 | 5.685 |
| 3.3003327837123217 | 2.843 |
| 4.15016639185616 | 6.421 |
| 2.07508319592808 | 3.211 |
| 3.53754159796404 | 6.605 |
| 6.76877079898202 | 3.303 |
| 5.88438539949101 | 6.651 |
| 7.942192699745505 | 3.326 |
| 8.971096349872752 | 1.663 |
| 9.485548174936376 | 0.831 |
| 9.742774087468188 | 0.416 |
| 4.871387043734094 | 0.208 |
| 7.435693521867047 | 0.104 |
| 8.717846760933524 | 0.052 |
| 4.358923380466762 | 0.026 |
| 2.179461690233381 | 0.013 |
| 3.5897308451166907 | 5.006 |
| 6.794865422558345 | 2.503 |
| 3.3974327112791727 | 1.252 |
| 1.6987163556395863 | 0.626 |
| 0.8493581778197932 | 0.313 |
| 0.4246790889098966 | 0.156 |
| 2.7123395444549483 | 5.078 |
| 1.3561697722274741 | 2.539 |
| 0.6780848861137371 | 1.27 |
| 0.33904244305686854 | 0.635 |
| 2.6695212215284343 | 5.317 |
| 3.834760610764217 | 7.659 |
| 4.417380305382109 | 8.829 |
| 2.2086901526910543 | 4.415 |
| 3.604345076345527 | 7.207 |
| 4.302172538172764 | 8.604 |
| 7.151086269086382 | 4.302 |
| 3.575543134543191 | 2.151 |
| 6.787771567271596 | 1.075 |
| 8.393885783635799 | 0.538 |
| 9.1969428918179 | 0.269 |
| 7.09847144590895 | 5.134 |
| 6.049235722954474 | 7.567 |
| 5.524617861477237 | 8.784 |
| 5.262308930738619 | 9.392 |
| 7.63115446536931 | 4.696 |
| 6.315577232684655 | 7.348 |
| 5.657788616342327 | 8.674 |
| 7.828894308171163 | 4.337 |
| 3.9144471540855816 | 2.168 |
| 6.957223577042791 | 1.084 |
| 3.4786117885213956 | 0.542 |
| 6.739305894260697 | 0.271 |
| 8.369652947130348 | 0.136 |
| 9.184826473565174 | 0.068 |
| 9.592413236782587 | 0.034 |
| 9.796206618391293 | 0.017 |
| 9.898103309195648 | 0.008 |
| 4.949051654597824 | 0.004 |
| 4.974525827298912 | 5.002 |
| 2.487262913649456 | 2.501 |
| 6.243631456824728 | 1.251 |
| 5.621815728412364 | 5.625 |
| 5.310907864206182 | 7.813 |
| 5.155453932103091 | 8.906 |
| 5.077726966051546 | 9.453 |
| 5.038863483025773 | 9.727 |
| 7.519431741512887 | 4.863 |
| 3.7597158707564433 | 2.432 |
| 6.879857935378222 | 1.216 |
| 3.439928967689111 | 0.608 |
| 4.219964483844556 | 5.304 |
| 7.109982241922278 | 2.652 |
| 6.054991120961139 | 6.326 |
| 3.0274955604805696 | 3.163 |
| 4.013747780240285 | 6.581 |
| 7.006873890120143 | 3.291 |
| 8.503436945060072 | 1.645 |
| 4.251718472530036 | 0.823 |
| 7.125859236265018 | 0.411 |
| 3.562929618132509 | 0.206 |
| 4.281464809066255 | 5.103 |
| 4.640732404533127 | 7.551 |
| 4.820366202266563 | 8.776 |
| 7.410183101133281 | 4.388 |
| 8.70509155056664 | 2.194 |
| 6.85254577528332 | 6.097 |
| 8.42627288764166 | 3.048 |
| 9.21313644382083 | 1.524 |
| 4.606568221910415 | 0.762 |
| 2.3032841109552074 | 0.381 |
| 3.6516420554776037 | 5.191 |
| 4.325821027738802 | 7.595 |
| 2.162910513869401 | 3.798 |
| 1.0814552569347005 | 1.899 |
| 3.0407276284673506 | 5.949 |
| 4.020363814233676 | 7.975 |
| 7.010181907116838 | 3.987 |
| 8.505090953558419 | 1.994 |
| 4.2525454767792095 | 0.997 |
| 2.1262727383896047 | 0.498 |
| 3.5631363691948024 | 5.249 |
| 6.7815681845974005 | 2.625 |
| 3.3907840922987003 | 1.312 |
| 6.69539204614935 | 0.656 |
| 5.8476960230746755 | 5.328 |
| 5.423848011537338 | 7.664 |
| 5.211924005768669 | 8.832 |
| 5.105962002884334 | 9.416 |
| 5.052981001442167 | 9.708 |
| 7.526490500721083 | 4.854 |
| 6.263245250360542 | 7.427 |
| 3.131622625180271 | 3.714 |
| 1.5658113125901354 | 1.857 |
| 5.782905656295068 | 0.928 |
| 5.391452828147534 | 5.464 |
| 5.195726414073767 | 7.732 |
| 2.5978632070368834 | 3.866 |
| 3.798931603518442 | 6.933 |
| 4.399465801759221 | 8.467 |
| 2.1997329008796105 | 4.233 |
| 1.0998664504398052 | 2.117 |
| 3.0499332252199025 | 6.058 |
| 1.5249666126099513 | 3.029 |
| 3.2624833063049756 | 6.515 |
| 1.6312416531524878 | 3.257 |
| 3.315620826576244 | 6.629 |
| 6.6578104132881215 | 3.314 |
| 8.32890520664406 | 1.657 |
| 9.16445260332203 | 0.829 |
| 7.082226301661015 | 5.414 |
| 3.5411131508305074 | 2.707 |
| 6.770556575415254 | 1.354 |
| 8.385278287707628 | 0.677 |
| 9.192639143853814 | 0.338 |
| 9.596319571926907 | 0.169 |
| 4.7981597859634535 | 0.085 |
| 2.3990798929817267 | 0.042 |
| 1.1995399464908634 | 0.021 |
| 0.5997699732454317 | 0.011 |
| 2.7998849866227156 | 5.005 |
| 3.899942493311358 | 7.503 |
| 1.949971246655679 | 3.751 |
| 0.9749856233278394 | 1.876 |
| 0.4874928116639197 | 0.938 |
| 0.24374640583195986 | 0.469 |
| 0.12187320291597993 | 0.234 |
| 5.06093660145799 | 0.117 |
| 5.0304683007289945 | 5.059 |
| 5.015234150364497 | 7.529 |
| 5.007617075182249 | 8.765 |
| 7.503808537591125 | 4.382 |
| 6.251904268795562 | 7.191 |
| 3.125952134397781 | 3.596 |
| 1.5629760671988906 | 1.798 |
| 5.781488033599445 | 0.899 |
| 7.890744016799722 | 0.449 |
| 8.945372008399861 | 0.225 |
| 4.472686004199931 | 0.112 |
| 7.236343002099965 | 0.056 |
| 3.6181715010499826 | 0.028 |
| 1.8090857505249913 | 0.014 |
| 3.4045428752624955 | 5.007 |
| 6.702271437631248 | 2.504 |
| 8.351135718815623 | 1.252 |
| 6.675567859407812 | 5.626 |
| 3.337783929703906 | 2.813 |
| 1.668891964851953 | 1.406 |
| 3.3344459824259767 | 5.703 |
| 4.167222991212988 | 7.852 |
| 4.583611495606494 | 8.926 |
| 4.791805747803247 | 9.463 |
| 4.8959028739016235 | 9.731 |
| 7.447951436950811 | 4.866 |
| 6.223975718475406 | 7.433 |
| 5.611987859237702 | 8.716 |
| 5.305993929618851 | 9.358 |
| 7.652996964809425 | 4.679 |
| 8.826498482404713 | 2.34 |
| 6.913249241202356 | 6.17 |
| 3.456624620601178 | 3.085 |
| 4.2283123103005895 | 6.542 |
| 2.1141561551502948 | 3.271 |
| 6.057078077575147 | 1.636 |
| 5.5285390387875735 | 5.818 |
| 5.264269519393787 | 7.909 |
| 2.6321347596968936 | 3.954 |
| 1.3160673798484468 | 1.977 |
| 5.658033689924224 | 0.989 |
| 7.829016844962112 | 0.494 |
| 6.414508422481056 | 5.247 |
| 3.207254211240528 | 2.624 |
| 4.103627105620264 | 6.312 |
| 2.051813552810132 | 3.156 |
| 1.025906776405066 | 1.578 |
| 5.512953388202533 | 0.789 |
| 5.256476694101266 | 5.394 |
| 2.628238347050633 | 2.697 |
| 1.3141191735253166 | 1.349 |
| 3.1570595867626583 | 5.674 |
| 6.578529793381329 | 2.837 |
| 5.789264896690664 | 6.419 |
| 5.394632448345332 | 8.209 |
| 2.697316224172666 | 4.105 |
| 6.3486581120863335 | 2.052 |
| 5.674329056043167 | 6.026 |
| 2.8371645280215834 | 3.013 |
| 1.4185822640107917 | 1.507 |
| 3.209291132005396 | 5.753 |
| 6.604645566002699 | 2.877 |
| 8.30232278300135 | 1.438 |
| 4.151161391500675 | 0.719 |
| 4.575580695750338 | 5.36 |
| 4.787790347875169 | 7.68 |
| 4.893895173937585 | 8.84 |
| 2.4469475869687924 | 4.42 |
| 6.223473793484397 | 2.21 |
| 8.111736896742197 | 1.105 |
| 4.055868448371099 | 0.552 |
| 4.527934224185549 | 5.276 |
| 4.763967112092775 | 7.638 |
| 7.381983556046388 | 3.819 |
| 6.190991778023194 | 6.91 |
| 5.5954958890115964 | 8.455 |
| 7.797747944505798 | 4.227 |
| 6.398873972252899 | 7.114 |
| 3.1994369861264493 | 3.557 |
| 6.599718493063225 | 1.778 |
| 8.299859246531613 | 0.889 |
| 4.149929623265806 | 0.445 |
| 4.574964811632903 | 5.222 |
| 7.287482405816451 | 2.611 |
| 3.6437412029082257 | 1.306 |
| 6.821870601454113 | 0.653 |
| 8.410935300727056 | 0.326 |
| 4.205467650363528 | 0.163 |
| 7.1027338251817635 | 0.082 |
| 6.051366912590882 | 5.041 |
| 8.025683456295441 | 2.52 |
| 6.512841728147721 | 6.26 |
| 3.2564208640738603 | 3.13 |
| 6.62821043203693 | 1.565 |
| 5.814105216018465 | 5.783 |
| 7.9070526080092325 | 2.891 |
| 3.9535263040046162 | 1.446 |
| 1.9767631520023081 | 0.723 |
| 0.9883815760011541 | 0.361 |
| 0.49419078800057703 | 0.181 |
| 0.24709539400028852 | 0.09 |
| 5.123547697000144 | 0.045 |
| 5.0617738485000725 | 5.023 |
| 7.530886924250036 | 2.511 |
| 3.765443462125018 | 1.256 |
| 1.882721731062509 | 0.628 |
| 3.441360865531254 | 5.314 |
| 4.2206804327656275 | 7.657 |
| 2.1103402163828138 | 3.828 |
| 1.0551701081914069 | 1.914 |
| 0.5275850540957034 | 0.957 |
| 2.763792527047852 | 5.479 |
| 6.381896263523926 | 2.739 |
| 5.690948131761963 | 6.37 |
| 2.8454740658809814 | 3.185 |
| 3.922737032940491 | 6.592 |
| 6.9613685164702455 | 3.296 |
| 3.4806842582351227 | 1.648 |
| 6.740342129117561 | 0.824 |
| 8.37017106455878 | 0.412 |
| 9.185085532279391 | 0.206 |
| 7.092542766139696 | 5.103 |
| 8.546271383069847 | 2.552 |
| 9.273135691534923 | 1.276 |
| 9.636567845767463 | 0.638 |
| 7.318283922883731 | 5.319 |
| 6.159141961441866 | 7.659 |
| 8.079570980720932 | 3.83 |
| 4.039785490360466 | 1.915 |
| 4.519892745180233 | 5.957 |
| 4.759946372590116 | 7.979 |
| 7.379973186295058 | 3.989 |
| 6.189986593147529 | 6.995 |
| 5.594993296573764 | 8.497 |
| 2.797496648286882 | 4.249 |
| 1.398748324143441 | 2.124 |
| 3.19937416207172 | 6.062 |
| 6.59968708103586 | 3.031 |
| 3.29984354051793 | 1.516 |
| 1.649921770258965 | 0.758 |
| 0.8249608851294825 | 0.379 |
| 5.412480442564742 | 0.189 |
| 7.706240221282371 | 0.095 |
| 3.8531201106411856 | 0.047 |
| 6.926560055320593 | 0.024 |
| 8.463280027660296 | 0.012 |
| 4.231640013830148 | 0.006 |
| 7.115820006915074 | 0.003 |
| 3.557910003457537 | 0.001 |
| 6.778955001728768 | 0.001 |
| 3.389477500864384 | 0 |
| 4.194738750432192 | 5 |
| 2.097369375216096 | 2.5 |
| 3.548684687608048 | 6.25 |
| 6.774342343804024 | 3.125 |
| 8.387171171902011 | 1.563 |
| 6.693585585951006 | 5.781 |
| 5.846792792975503 | 7.891 |
| 2.9233963964877514 | 3.945 |
| 3.9616981982438757 | 6.973 |
| 1.9808490991219379 | 3.486 |
| 0.9904245495609689 | 1.743 |
| 0.49521227478048446 | 0.872 |
| 0.24760613739024223 | 0.436 |
| 5.123803068695121 | 0.218 |
| 7.561901534347561 | 0.109 |
| 8.780950767173781 | 0.054 |
| 9.39047538358689 | 0.027 |
| 7.195237691793445 | 5.014 |
| 3.5976188458967227 | 2.507 |
| 4.298809422948361 | 6.253 |
| 4.6494047114741806 | 8.127 |
| 4.82470235573709 | 9.063 |
| 2.412351177868545 | 4.532 |
| 3.7061755889342725 | 7.266 |
| 4.353087794467136 | 8.633 |
| 2.176543897233568 | 4.316 |
| 6.088271948616784 | 2.158 |
| 8.044135974308393 | 1.079 |
| 9.022067987154196 | 0.54 |
| 7.011033993577098 | 5.27 |
| 8.505516996788549 | 2.635 |
| 9.252758498394275 | 1.317 |
| 9.626379249197138 | 0.659 |
| 4.813189624598569 | 0.329 |
| 7.406594812299284 | 0.165 |
| 8.703297406149641 | 0.082 |
| 6.8516487030748205 | 5.041 |
| 8.425824351537411 | 2.521 |
| 4.212912175768706 | 1.26 |
| 4.606456087884353 | 5.63 |
| 2.3032280439421764 | 2.815 |
| 6.151614021971088 | 1.408 |
| 5.575807010985544 | 5.704 |
| 5.287903505492772 | 7.852 |
| 2.643951752746386 | 3.926 |
| 3.821975876373193 | 6.963 |
| 6.910987938186596 | 3.481 |
| 5.955493969093299 | 6.741 |
| 2.9777469845466493 | 3.37 |
| 1.4888734922733247 | 1.685 |
| 3.244436746136662 | 5.843 |
| 6.622218373068331 | 2.921 |
| 3.3111091865341655 | 1.461 |
| 4.155554593267083 | 5.73 |
| 4.577777296633542 | 7.865 |
| 7.288888648316771 | 3.933 |
| 3.6444443241583855 | 1.966 |
| 6.822222162079193 | 0.983 |
| 5.911111081039596 | 5.492 |
| 2.955555540519798 | 2.746 |
| 3.977777770259899 | 6.373 |
| 6.988888885129949 | 3.186 |
| 8.494444442564975 | 1.593 |
| 6.747222221282487 | 5.797 |
| 5.873611110641244 | 7.898 |
| 7.936805555320622 | 3.949 |
| 6.468402777660311 | 6.975 |
| 3.2342013888301553 | 3.487 |
| 1.6171006944150776 | 1.744 |
| 5.8085503472075395 | 0.872 |
| 5.40427517360377 | 5.436 |
| 5.202137586801885 | 7.718 |
| 2.6010687934009424 | 3.859 |
| 1.3005343967004712 | 1.929 |
| 0.6502671983502356 | 0.965 |
| 5.325133599175118 | 0.482 |
| 5.162566799587559 | 5.241 |
| 2.5812833997937794 | 2.621 |
| 3.7906416998968897 | 6.31 |
| 4.395320849948445 | 8.155 |
| 7.197660424974222 | 4.078 |
| 3.598830212487111 | 2.039 |
| 4.299415106243556 | 6.019 |
| 4.649707553121778 | 8.01 |
| 4.824853776560889 | 9.005 |
| 7.412426888280445 | 4.502 |
| 6.206213444140222 | 7.251 |
| 8.10310672207011 | 3.626 |
| 9.051553361035054 | 1.813 |
| 4.525776680517527 | 0.906 |
| 4.762888340258764 | 5.453 |
| 4.881444170129382 | 7.727 |
| 4.9407220850646905 | 8.863 |
| 4.970361042532345 | 9.432 |
| 2.4851805212661726 | 4.716 |
| 1.2425902606330863 | 2.358 |
| 0.6212951303165432 | 1.179 |
| 5.310647565158272 | 0.589 |
| 7.655323782579136 | 0.295 |
| 8.827661891289567 | 0.147 |
| 6.913830945644784 | 5.074 |
| 8.456915472822391 | 2.537 |
| 6.728457736411196 | 6.268 |
| 3.364228868205598 | 3.134 |
| 4.1821144341027985 | 6.567 |
| 7.091057217051399 | 3.284 |
| 3.5455286085256996 | 1.642 |
| 6.77276430426285 | 0.821 |
| 5.886382152131425 | 5.41 |
| 2.9431910760657125 | 2.705 |
| 1.4715955380328563 | 1.353 |
| 5.735797769016428 | 0.676 |
| 7.8678988845082145 | 0.338 |
| 8.933949442254107 | 0.169 |
| 9.466974721127054 | 0.085 |
| 4.733487360563527 | 0.042 |
| 4.866743680281763 | 5.021 |
| 2.4333718401408815 | 2.511 |
| 3.7166859200704407 | 6.255 |
| 6.85834296003522 | 3.128 |
| 8.42917148001761 | 1.564 |
| 9.214585740008804 | 0.782 |
| 7.107292870004402 | 5.391 |
| 3.553646435002201 | 2.695 |
| 6.7768232175011 | 1.348 |
| 8.38841160875055 | 0.674 |
| 6.694205804375275 | 5.337 |
| 8.347102902187638 | 2.668 |
| 6.673551451093819 | 6.334 |
| 3.3367757255469095 | 3.167 |
| 1.6683878627734547 | 1.584 |
| 0.8341939313867274 | 0.792 |
| 5.417096965693364 | 0.396 |
| 5.208548482846682 | 5.198 |
| 2.604274241423341 | 2.599 |
| 6.30213712071167 | 1.299 |
| 5.651068560355835 | 5.65 |
| 2.8255342801779175 | 2.825 |
| 6.412767140088959 | 1.412 |
| 5.70638357004448 | 5.706 |
| 2.85319178502224 | 2.853 |
| 1.42659589251112 | 1.427 |
| 3.21329794625556 | 5.713 |
| 1.60664897312778 | 2.857 |
| 0.80332448656389 | 1.428 |
| 5.401662243281946 | 0.714 |
| 7.700831121640973 | 0.357 |
| 3.8504155608204864 | 0.179 |
| 6.925207780410243 | 0.089 |
| 3.4626038902051217 | 0.045 |
| 6.731301945102561 | 0.022 |
| 5.865650972551281 | 5.011 |
| 5.43282548627564 | 7.506 |
| 5.21641274313782 | 8.753 |
| 5.10820637156891 | 9.376 |
| 5.054103185784455 | 9.688 |
| 7.527051592892228 | 4.844 |
| 3.763525796446114 | 2.422 |
| 1.881762898223057 | 1.211 |
| 5.9408814491115285 | 0.606 |
| 2.9704407245557642 | 0.303 |
| 6.485220362277882 | 0.151 |
| 3.242610181138941 | 0.076 |
| 4.121305090569471 | 5.038 |
| 4.560652545284736 | 7.519 |
| 7.280326272642368 | 3.759 |
| 3.640163136321184 | 1.88 |
| 4.320081568160592 | 5.94 |
| 4.660040784080296 | 7.97 |
| 7.330020392040148 | 3.985 |
| 6.165010196020074 | 6.992 |
| 3.082505098010037 | 3.496 |
| 6.541252549005018 | 1.748 |
| 3.270626274502509 | 0.874 |
| 4.135313137251255 | 5.437 |
| 4.567656568625628 | 7.719 |
| 7.283828284312814 | 3.859 |
| 8.641914142156407 | 1.93 |
| 6.820957071078204 | 5.965 |
| 8.410478535539102 | 2.982 |
| 4.205239267769551 | 1.491 |
| 4.602619633884776 | 5.746 |
| 4.801309816942387 | 7.873 |
| 4.900654908471194 | 8.936 |
| 4.950327454235596 | 9.468 |
| 2.475163727117798 | 4.734 |
| 6.2375818635588995 | 2.367 |
| 8.11879093177945 | 1.184 |
| 9.059395465889725 | 0.592 |
| 9.529697732944863 | 0.296 |
| 7.264848866472431 | 5.148 |
| 8.632424433236215 | 2.574 |
| 6.816212216618108 | 6.287 |
| 8.408106108309054 | 3.143 |
| 9.204053054154528 | 1.572 |
| 4.602026527077264 | 0.786 |
| 7.301013263538632 | 0.393 |
| 8.650506631769316 | 0.196 |
| 6.825253315884658 | 5.098 |
| 3.412626657942329 | 2.549 |
| 6.706313328971165 | 1.275 |
| 5.853156664485582 | 5.637 |
| 7.926578332242791 | 2.819 |
| 6.463289166121395 | 6.409 |
| 3.2316445830606977 | 3.205 |
| 4.115822291530349 | 6.602 |
| 7.057911145765175 | 3.301 |
| 8.528955572882587 | 1.651 |
| 6.764477786441294 | 5.825 |
| 8.382238893220647 | 2.913 |
| 9.191119446610323 | 1.456 |
| 4.595559723305161 | 0.728 |
| 2.2977798616525806 | 0.364 |
| 3.6488899308262903 | 5.182 |
| 1.8244449654131452 | 2.591 |
| 0.9122224827065726 | 1.296 |
| 2.9561112413532866 | 5.648 |
| 3.9780556206766433 | 7.824 |
| 6.989027810338321 | 3.912 |
| 3.4945139051691605 | 1.956 |
| 1.7472569525845802 | 0.978 |
| 5.87362847629229 | 0.489 |
| 2.936814238146145 | 0.244 |
| 3.9684071190730723 | 5.122 |
| 6.984203559536536 | 2.561 |
| 8.492101779768268 | 1.281 |
| 6.746050889884134 | 5.64 |
| 3.373025444942067 | 2.82 |
| 6.686512722471033 | 1.41 |
| 8.343256361235516 | 0.705 |
| 4.171628180617758 | 0.353 |
| 7.0858140903088795 | 0.176 |
| 3.5429070451544398 | 0.088 |
| 1.7714535225772199 | 0.044 |
| 0.8857267612886099 | 0.022 |
| 0.44286338064430497 | 0.011 |
| 2.7214316903221527 | 5.006 |
| 6.360715845161076 | 2.503 |
| 3.180357922580538 | 1.251 |
| 1.590178961290269 | 0.626 |
| 0.7950894806451345 | 0.313 |
| 2.8975447403225676 | 5.156 |
| 1.4487723701612838 | 2.578 |
| 0.7243861850806419 | 1.289 |
| 0.36219309254032095 | 0.645 |
| 5.18109654627016 | 0.322 |
| 5.09054827313508 | 5.161 |
| 5.04527413656754 | 7.581 |
| 5.02263706828377 | 8.79 |
| 2.511318534141885 | 4.395 |
| 6.255659267070943 | 2.198 |
| 5.627829633535471 | 6.099 |
| 5.313914816767736 | 8.049 |
| 5.156957408383867 | 9.025 |
| 5.078478704191934 | 9.512 |
| 5.039239352095967 | 9.756 |
| 7.519619676047983 | 4.878 |
| 6.259809838023992 | 7.439 |
| 5.629904919011996 | 8.72 |
| 5.314952459505998 | 9.36 |
| 5.157476229752999 | 9.68 |
| 2.5787381148764994 | 4.84 |
| 3.7893690574382495 | 7.42 |
| 4.394684528719125 | 8.71 |
| 7.197342264359563 | 4.355 |
| 6.098671132179781 | 7.177 |
| 8.04933556608989 | 3.589 |
| 4.024667783044945 | 1.794 |
| 7.012333891522473 | 0.897 |
| 3.5061669457612363 | 0.449 |
| 4.253083472880618 | 5.224 |
| 7.126541736440309 | 2.612 |
| 8.563270868220155 | 1.306 |
| 9.281635434110077 | 0.653 |
| 9.64081771705504 | 0.327 |
| 4.82040885852752 | 0.163 |
| 4.91020442926376 | 5.082 |
| 7.45510221463188 | 2.541 |
| 3.72755110731594 | 1.27 |
| 4.36377555365797 | 5.635 |
| 7.181887776828985 | 2.818 |
| 3.5909438884144924 | 1.409 |
| 1.7954719442072462 | 0.704 |
| 0.8977359721036231 | 0.352 |
| 2.9488679860518117 | 5.176 |
| 3.974433993025906 | 7.588 |
| 6.987216996512952 | 3.794 |
| 3.493608498256476 | 1.897 |
| 6.746804249128238 | 0.949 |
| 8.37340212456412 | 0.474 |
| 4.18670106228206 | 0.237 |
| 4.59335053114103 | 5.119 |
| 4.796675265570515 | 7.559 |
| 4.898337632785258 | 8.78 |
| 7.449168816392628 | 4.39 |
| 6.224584408196314 | 7.195 |
| 3.112292204098157 | 3.597 |
| 1.5561461020490786 | 1.799 |
| 3.2780730510245393 | 5.899 |
| 4.139036525512269 | 7.95 |
| 4.569518262756135 | 8.975 |
| 4.784759131378067 | 9.487 |
| 4.892379565689033 | 9.744 |
| 2.4461897828445167 | 4.872 |
| 3.7230948914222584 | 7.436 |
| 4.361547445711129 | 8.718 |
| 7.180773722855564 | 4.359 |
| 8.590386861427781 | 2.179 |
| 6.795193430713891 | 6.09 |
| 3.3975967153569453 | 3.045 |
| 4.198798357678473 | 6.522 |
| 7.099399178839237 | 3.261 |
| 6.049699589419618 | 6.631 |
| 5.524849794709809 | 8.315 |
| 5.262424897354904 | 9.158 |
| 5.131212448677452 | 9.579 |
| 5.065606224338726 | 9.789 |
| 5.032803112169363 | 9.895 |
| 5.0164015560846815 | 9.947 |
| 5.00820077804234 | 9.974 |
| 7.50410038902117 | 4.987 |
| 6.252050194510585 | 7.493 |
| 3.1260250972552925 | 3.747 |
| 4.063012548627646 | 6.873 |
| 2.031506274313823 | 3.437 |
| 3.5157531371569117 | 6.718 |
| 1.7578765685784559 | 3.359 |
| 3.378938284289228 | 6.68 |
| 6.689469142144613 | 3.34 |
| 3.3447345710723067 | 1.67 |
| 4.172367285536153 | 5.835 |
| 7.086183642768077 | 2.917 |
| 6.0430918213840386 | 6.459 |
| 3.0215459106920193 | 3.229 |
| 4.01077295534601 | 6.615 |
| 7.005386477673005 | 3.307 |
| 8.502693238836503 | 1.654 |
| 6.751346619418252 | 5.827 |
| 5.875673309709126 | 7.913 |
| 2.937836654854563 | 3.957 |
| 1.4689183274272815 | 1.978 |
| 0.7344591637136407 | 0.989 |
| 2.86722958185682 | 5.495 |
| 6.433614790928409 | 2.747 |
| 5.716807395464205 | 6.374 |
| 5.358403697732102 | 8.187 |
| 5.179201848866051 | 9.093 |
| 5.089600924433025 | 9.547 |
| 2.5448004622165126 | 4.773 |
| 3.7724002311082563 | 7.387 |
| 4.386200115554129 | 8.693 |
| 4.693100057777064 | 9.347 |
| 7.346550028888532 | 4.673 |
| 3.673275014444266 | 2.337 |
| 1.836637507222133 | 1.168 |
| 3.418318753611066 | 5.584 |
| 6.709159376805533 | 2.792 |
| 8.354579688402767 | 1.396 |
| 9.177289844201383 | 0.698 |
| 7.088644922100691 | 5.349 |
| 3.5443224610503457 | 2.675 |
| 1.7721612305251728 | 1.337 |
| 5.886080615262586 | 0.669 |
| 2.943040307631293 | 0.334 |
| 6.471520153815646 | 0.167 |
| 8.235760076907823 | 0.084 |
| 6.617880038453912 | 5.042 |
| 3.308940019226956 | 2.521 |
| 6.654470009613478 | 1.26 |
| 8.327235004806738 | 0.63 |
| 4.163617502403369 | 0.315 |
| 2.0818087512016845 | 0.158 |
| 6.040904375600842 | 0.079 |
| 3.020452187800421 | 0.039 |
| 1.5102260939002106 | 0.02 |
| 5.755113046950105 | 0.01 |
| 7.877556523475052 | 0.005 |
| 6.438778261737526 | 5.002 |
| 8.219389130868763 | 2.501 |
| 6.609694565434381 | 6.251 |
| 8.30484728271719 | 3.125 |
| 4.152423641358595 | 1.563 |
| 2.0762118206792977 | 0.781 |
| 1.0381059103396488 | 0.391 |
| 0.5190529551698244 | 0.195 |
| 0.2595264775849122 | 0.098 |
| 0.1297632387924561 | 0.049 |
| 0.06488161939622805 | 0.024 |
| 5.032440809698114 | 0.012 |
| 5.016220404849057 | 5.006 |
| 7.508110202424529 | 2.503 |
| 3.7540551012122645 | 1.252 |
| 6.877027550606132 | 0.626 |
| 5.938513775303067 | 5.313 |
| 2.9692568876515333 | 2.656 |
| 3.9846284438257666 | 6.328 |
| 6.992314221912883 | 3.164 |
| 3.4961571109564415 | 1.582 |
| 1.7480785554782208 | 0.791 |
| 3.3740392777391106 | 5.396 |
| 4.187019638869556 | 7.698 |
| 7.093509819434778 | 3.849 |
| 6.046754909717389 | 6.924 |
| 5.523377454858695 | 8.462 |
| 7.761688727429347 | 4.231 |
| 6.380844363714674 | 7.116 |
| 3.190422181857337 | 3.558 |
| 1.5952110909286685 | 1.779 |
| 5.797605545464334 | 0.889 |
| 7.898802772732167 | 0.445 |
| 6.449401386366084 | 5.222 |
| 3.224700693183042 | 2.611 |
| 1.612350346591521 | 1.306 |
| 3.3061751732957605 | 5.653 |
| 6.65308758664788 | 2.826 |
| 8.326543793323939 | 1.413 |
| 4.1632718966619695 | 0.707 |
| 4.581635948330985 | 5.353 |
| 4.790817974165492 | 7.677 |
| 4.895408987082746 | 8.838 |
| 4.947704493541373 | 9.419 |
| 4.9738522467706865 | 9.71 |
| 7.486926123385343 | 4.855 |
| 6.243463061692672 | 7.427 |
| 5.621731530846336 | 8.714 |
| 2.810865765423168 | 4.357 |
| 3.905432882711584 | 7.178 |
| 6.952716441355792 | 3.589 |
| 8.476358220677895 | 1.795 |
| 4.2381791103389475 | 0.897 |
| 7.119089555169474 | 0.449 |
| 8.559544777584737 | 0.224 |
| 4.279772388792368 | 0.112 |
| 4.639886194396184 | 5.056 |
| 2.319943097198092 | 2.528 |
| 1.159971548599046 | 1.264 |
| 5.579985774299523 | 0.632 |
| 5.2899928871497615 | 5.316 |
| 2.6449964435748807 | 2.658 |
| 1.3224982217874404 | 1.329 |
| 3.16124911089372 | 5.665 |
| 6.58062455544686 | 2.832 |
| 3.29031227772343 | 1.416 |
| 4.145156138861715 | 5.708 |
| 7.0725780694308575 | 2.854 |
| 6.036289034715429 | 6.427 |
| 3.0181445173577144 | 3.214 |
| 6.509072258678858 | 1.607 |
| 8.254536129339428 | 0.803 |
| 9.127268064669714 | 0.402 |
| 9.563634032334857 | 0.201 |
| 4.7818170161674285 | 0.1 |
| 4.890908508083714 | 5.05 |
| 4.945454254041858 | 7.525 |
| 4.972727127020929 | 8.763 |
| 7.486363563510464 | 4.381 |
| 3.743181781755232 | 2.191 |
| 6.871590890877616 | 1.095 |
| 5.935795445438808 | 5.548 |
| 2.967897722719404 | 2.774 |
| 6.483948861359702 | 1.387 |
| 3.241974430679851 | 0.693 |
| 1.6209872153399254 | 0.347 |
| 5.810493607669963 | 0.173 |
| 7.905246803834982 | 0.087 |
| 3.952623401917491 | 0.043 |
| 4.476311700958745 | 5.022 |
| 2.2381558504793726 | 2.511 |
| 1.1190779252396863 | 1.255 |
| 5.559538962619843 | 0.628 |
| 2.7797694813099216 | 0.314 |
| 1.3898847406549608 | 0.157 |
| 5.694942370327481 | 0.078 |
| 7.847471185163741 | 0.039 |
| 8.92373559258187 | 0.02 |
| 9.461867796290935 | 0.01 |
| 9.730933898145468 | 0.005 |
| 9.865466949072733 | 0.002 |
| 9.932733474536366 | 0.001 |
| 9.966366737268183 | 0.001 |
| 9.98318336863409 | 0 |
| 9.991591684317045 | 0 |
| 4.995795842158523 | 0 |
| 2.4978979210792613 | 0 |
| 1.2489489605396307 | 0 |
| 3.1244744802698152 | 5 |
| 4.062237240134907 | 7.5 |
| 4.531118620067454 | 8.75 |
| 2.265559310033727 | 4.375 |
| 1.1327796550168634 | 2.188 |
| 3.0663898275084316 | 6.094 |
| 6.533194913754215 | 3.047 |
| 5.766597456877108 | 6.523 |
| 7.883298728438554 | 3.262 |
| 3.941649364219277 | 1.631 |
| 4.4708246821096385 | 5.815 |
| 7.235412341054819 | 2.908 |
| 3.6177061705274096 | 1.454 |
| 1.8088530852637048 | 0.727 |
| 0.9044265426318524 | 0.363 |
| 5.452213271315926 | 0.182 |
| 7.726106635657963 | 0.091 |
| 8.863053317828982 | 0.045 |
| 4.431526658914491 | 0.023 |
| 7.215763329457245 | 0.011 |
| 3.6078816647286227 | 0.006 |
| 4.303940832364312 | 5.003 |
| 2.151970416182156 | 2.501 |
| 6.075985208091078 | 1.251 |
| 3.037992604045539 | 0.625 |
| 4.018996302022769 | 5.313 |
| 4.5094981510113845 | 7.656 |
| 4.754749075505693 | 8.828 |
| 4.877374537752846 | 9.414 |
| 4.938687268876423 | 9.707 |
| 2.4693436344382116 | 4.854 |
| 3.734671817219106 | 7.427 |
| 1.867335908609553 | 3.713 |
| 0.9336679543047764 | 1.857 |
| 5.466833977152388 | 0.928 |
| 7.733416988576193 | 0.464 |
| 6.366708494288097 | 5.232 |
| 5.683354247144049 | 7.616 |
| 5.341677123572024 | 8.808 |
| 5.170838561786012 | 9.404 |
| 2.585419280893006 | 4.702 |
| 6.292709640446503 | 2.351 |
| 5.646354820223252 | 6.176 |
| 5.323177410111626 | 8.088 |
| 5.161588705055813 | 9.044 |
| 5.0807943525279065 | 9.522 |
| 7.540397176263953 | 4.761 |
| 3.7701985881319766 | 2.38 |
| 4.385099294065988 | 6.19 |
| 7.192549647032994 | 3.095 |
| 6.096274823516497 | 6.548 |
| 3.0481374117582485 | 3.274 |
| 4.024068705879124 | 6.637 |
| 4.512034352939562 | 8.318 |
| 7.256017176469781 | 4.159 |
| 3.6280085882348905 | 2.08 |
| 4.314004294117446 | 6.04 |
| 4.657002147058723 | 8.02 |
| 7.328501073529361 | 4.01 |
| 3.6642505367646807 | 2.005 |
| 1.8321252683823404 | 1.002 |
| 3.41606263419117 | 5.501 |
| 1.708031317095585 | 2.751 |
| 0.8540156585477925 | 1.375 |
| 0.42700782927389624 | 0.688 |
| 0.21350391463694812 | 0.344 |
| 5.106751957318473 | 0.172 |
| 2.5533759786592367 | 0.086 |
| 3.776687989329618 | 5.043 |
| 6.888343994664809 | 2.521 |
| 8.444171997332404 | 1.261 |
| 6.722085998666202 | 5.63 |
| 8.361042999333101 | 2.815 |
| 6.6805214996665505 | 6.408 |
| 5.840260749833275 | 8.204 |
| 5.420130374916638 | 9.102 |
| 7.710065187458319 | 4.551 |
| 8.85503259372916 | 2.275 |
| 4.42751629686458 | 1.138 |
| 7.21375814843229 | 0.569 |
| 3.606879074216145 | 0.284 |
| 4.303439537108073 | 5.142 |
| 7.151719768554036 | 2.571 |
| 3.575859884277018 | 1.286 |
| 4.2879299421385095 | 5.643 |
| 2.1439649710692548 | 2.821 |
| 6.071982485534628 | 1.411 |
| 3.035991242767314 | 0.705 |
| 4.0179956213836565 | 5.353 |
| 4.508997810691828 | 7.676 |
| 4.754498905345914 | 8.838 |
| 2.377249452672957 | 4.419 |
| 3.6886247263364784 | 7.21 |
| 4.344312363168239 | 8.605 |
| 7.1721561815841195 | 4.302 |
| 8.58607809079206 | 2.151 |
| 4.29303904539603 | 1.076 |
| 4.646519522698015 | 5.538 |
| 4.823259761349007 | 7.769 |
| 7.411629880674504 | 3.884 |
| 3.705814940337252 | 1.942 |
| 6.852907470168626 | 0.971 |
| 5.926453735084313 | 5.486 |
| 2.9632268675421565 | 2.743 |
| 1.4816134337710782 | 1.371 |
| 3.2408067168855395 | 5.686 |
| 4.12040335844277 | 7.843 |
| 7.060201679221385 | 3.921 |
| 6.030100839610693 | 6.961 |
| 3.0150504198053465 | 3.48 |
| 1.5075252099026732 | 1.74 |
| 3.2537626049513366 | 5.87 |
| 1.6268813024756683 | 2.935 |
| 0.8134406512378342 | 1.468 |
| 5.406720325618918 | 0.734 |
| 5.203360162809458 | 5.367 |
| 2.601680081404729 | 2.683 |
| 6.300840040702365 | 1.342 |
| 8.150420020351183 | 0.671 |
| 4.075210010175591 | 0.335 |
| 7.037605005087796 | 0.168 |
| 8.518802502543899 | 0.084 |
| 9.25940125127195 | 0.042 |
| 7.129700625635975 | 5.021 |
| 3.5648503128179874 | 2.51 |
| 1.7824251564089937 | 1.255 |
| 3.391212578204497 | 5.628 |
| 4.1956062891022485 | 7.814 |
| 2.0978031445511243 | 3.907 |
| 6.048901572275563 | 1.953 |
| 5.524450786137781 | 5.977 |
| 2.7622253930688907 | 2.988 |
| 3.881112696534445 | 6.494 |
| 6.940556348267222 | 3.247 |
| 5.970278174133611 | 6.624 |
| 5.4851390870668055 | 8.312 |
| 7.742569543533403 | 4.156 |
| 3.8712847717667014 | 2.078 |
| 1.9356423858833507 | 1.039 |
| 3.4678211929416753 | 5.519 |
| 1.7339105964708377 | 2.76 |
| 5.866955298235419 | 1.38 |
| 5.43347764911771 | 5.69 |
| 2.716738824558855 | 2.845 |
| 3.858369412279427 | 6.422 |
| 1.9291847061397136 | 3.211 |
| 3.4645923530698566 | 6.606 |
| 6.732296176534929 | 3.303 |
| 8.366148088267465 | 1.651 |
| 4.183074044133733 | 0.826 |
| 4.591537022066866 | 5.413 |
| 7.295768511033433 | 2.706 |
| 6.147884255516717 | 6.353 |
| 3.0739421277583583 | 3.177 |
| 6.536971063879179 | 1.588 |
| 3.2684855319395894 | 0.794 |
| 6.634242765969795 | 0.397 |
| 8.317121382984897 | 0.199 |
| 6.658560691492449 | 5.099 |
| 5.829280345746224 | 7.55 |
| 5.414640172873112 | 8.775 |
| 2.707320086436556 | 4.387 |
| 1.353660043218278 | 2.194 |
| 3.176830021609139 | 6.097 |
| 6.588415010804569 | 3.048 |
| 5.794207505402285 | 6.524 |
| 7.897103752701142 | 3.262 |
| 6.448551876350571 | 6.631 |
| 5.7242759381752855 | 8.316 |
| 2.8621379690876427 | 4.158 |
| 3.9310689845438214 | 7.079 |
| 6.96553449227191 | 3.539 |
| 8.482767246135955 | 1.77 |
| 9.241383623067978 | 0.885 |
| 7.120691811533989 | 5.442 |
| 6.060345905766995 | 7.721 |
| 5.530172952883497 | 8.861 |
| 7.765086476441748 | 4.43 |
| 3.882543238220874 | 2.215 |
| 4.441271619110437 | 6.108 |
| 4.720635809555219 | 8.054 |
| 4.8603179047776095 | 9.027 |
| 7.430158952388805 | 4.513 |
| 8.715079476194402 | 2.257 |
| 9.357539738097202 | 1.128 |
| 7.178769869048601 | 5.564 |
| 3.5893849345243005 | 2.782 |
| 6.79469246726215 | 1.391 |
| 3.397346233631075 | 0.696 |
| 4.198673116815538 | 5.348 |
| 4.599336558407769 | 7.674 |
| 2.2996682792038845 | 3.837 |
| 6.149834139601943 | 1.918 |
| 5.574917069800971 | 5.959 |
| 2.7874585349004857 | 2.98 |
| 1.3937292674502428 | 1.49 |
| 5.696864633725121 | 0.745 |
| 5.34843231686256 | 5.372 |
| 5.17421615843128 | 7.686 |
| 2.58710807921564 | 3.843 |
| 1.29355403960782 | 1.922 |
| 5.64677701980391 | 0.961 |
| 7.823388509901955 | 0.48 |
| 6.4116942549509774 | 5.24 |
| 8.205847127475488 | 2.62 |
| 6.602923563737744 | 6.31 |
| 5.801461781868872 | 8.155 |
| 2.900730890934436 | 4.078 |
| 1.450365445467218 | 2.039 |
| 0.725182722733609 | 1.019 |
| 0.3625913613668045 | 0.51 |
| 5.181295680683402 | 0.255 |
| 7.590647840341701 | 0.127 |
| 8.795323920170851 | 0.064 |
| 4.397661960085426 | 0.032 |
| 2.198830980042713 | 0.016 |
| 3.5994154900213564 | 5.008 |
| 4.299707745010679 | 7.504 |
| 4.649853872505339 | 8.752 |
| 4.82492693625267 | 9.376 |
| 2.412463468126335 | 4.688 |
| 6.206231734063167 | 2.344 |
| 3.1031158670315837 | 1.172 |
| 1.5515579335157919 | 0.586 |
| 3.275778966757896 | 5.293 |
| 1.637889483378948 | 2.646 |
| 3.318944741689474 | 6.323 |
| 4.159472370844737 | 8.162 |
| 4.579736185422369 | 9.081 |
| 2.2898680927111843 | 4.54 |
| 1.1449340463555921 | 2.27 |
| 5.572467023177796 | 1.135 |
| 2.786233511588898 | 0.568 |
| 3.8931167557944493 | 5.284 |
| 1.9465583778972246 | 2.642 |
| 5.973279188948613 | 1.321 |
| 7.9866395944743065 | 0.66 |
| 3.9933197972371532 | 0.33 |
| 6.996659898618576 | 0.165 |
| 8.498329949309287 | 0.083 |
| 6.749164974654644 | 5.041 |
| 5.874582487327322 | 7.521 |
| 7.937291243663661 | 3.76 |
| 6.468645621831831 | 6.88 |
| 5.7343228109159154 | 8.44 |
| 2.8671614054579577 | 4.22 |
| 6.433580702728978 | 2.11 |
| 3.216790351364489 | 1.055 |
| 1.6083951756822445 | 0.528 |
| 5.804197587841123 | 0.264 |
| 7.902098793920562 | 0.132 |
| 3.951049396960281 | 0.066 |
| 4.4755246984801405 | 5.033 |
| 4.73776234924007 | 7.516 |
| 7.368881174620035 | 3.758 |
| 6.184440587310018 | 6.879 |
| 8.092220293655009 | 3.44 |
| 4.0461101468275045 | 1.72 |
| 4.523055073413753 | 5.86 |
| 7.261527536706876 | 2.93 |
| 8.630763768353438 | 1.465 |
| 9.31538188417672 | 0.732 |
| 7.15769094208836 | 5.366 |
| 6.07884547104418 | 7.683 |
| 5.5394227355220895 | 8.842 |
| 5.269711367761045 | 9.421 |
| 2.6348556838805224 | 4.71 |
| 3.817427841940261 | 7.355 |
| 1.9087139209701305 | 3.678 |
| 5.954356960485065 | 1.839 |
| 2.9771784802425323 | 0.919 |
| 6.488589240121266 | 0.46 |
| 5.744294620060633 | 5.23 |
| 5.372147310030316 | 7.615 |
| 7.686073655015158 | 3.807 |
| 3.843036827507579 | 1.904 |
| 6.921518413753789 | 0.952 |
| 5.960759206876895 | 5.476 |
| 2.9803796034384473 | 2.738 |
| 3.9901898017192234 | 6.369 |
| 1.9950949008596117 | 3.184 |
| 3.497547450429806 | 6.592 |
| 4.248773725214903 | 8.296 |
| 4.624386862607452 | 9.148 |
| 2.312193431303726 | 4.574 |
| 6.156096715651863 | 2.287 |
| 5.5780483578259314 | 6.144 |
| 7.789024178912966 | 3.072 |
| 3.894512089456483 | 1.536 |
| 6.947256044728242 | 0.768 |
| 8.473628022364121 | 0.384 |
| 4.2368140111820605 | 0.192 |
| 4.61840700559103 | 5.096 |
| 4.809203502795516 | 7.548 |
| 4.904601751397758 | 8.774 |
| 4.952300875698879 | 9.387 |
| 4.976150437849439 | 9.693 |
| 7.4880752189247195 | 4.847 |
| 8.74403760946236 | 2.423 |
| 9.37201880473118 | 1.212 |
| 9.68600940236559 | 0.606 |
| 9.843004701182796 | 0.303 |
| 7.421502350591398 | 5.151 |
| 8.710751175295698 | 2.576 |
| 9.355375587647849 | 1.288 |
| 4.6776877938239245 | 0.644 |
| 4.838843896911962 | 5.322 |
| 2.419421948455981 | 2.661 |
| 1.2097109742279906 | 1.33 |
| 3.104855487113995 | 5.665 |
| 4.052427743556997 | 7.833 |
| 4.5262138717784985 | 8.916 |
| 4.763106935889249 | 9.458 |
| 2.3815534679446246 | 4.729 |
| 1.1907767339723123 | 2.365 |
| 3.095388366986156 | 6.182 |
| 1.547694183493078 | 3.091 |
| 3.273847091746539 | 6.546 |
| 6.63692354587327 | 3.273 |
| 5.818461772936635 | 6.636 |
| 5.409230886468317 | 8.318 |
| 5.204615443234159 | 9.159 |
| 5.10230772161708 | 9.58 |
| 5.05115386080854 | 9.79 |
| 7.52557693040427 | 4.895 |
| 6.262788465202135 | 7.447 |
| 5.6313942326010675 | 8.724 |
| 2.8156971163005338 | 4.362 |
| 3.907848558150267 | 7.181 |
| 6.953924279075133 | 3.59 |
| 8.476962139537566 | 1.795 |
| 4.238481069768783 | 0.898 |
| 7.1192405348843915 | 0.449 |
| 8.559620267442195 | 0.224 |
| 6.779810133721098 | 5.112 |
| 5.889905066860549 | 7.556 |
| 7.944952533430275 | 3.778 |
| 3.9724762667151374 | 1.889 |
| 4.486238133357569 | 5.945 |
| 2.2431190666787844 | 2.972 |
| 3.621559533339392 | 6.486 |
| 4.310779766669696 | 8.243 |
| 7.155389883334848 | 4.122 |
| 6.077694941667424 | 7.061 |
| 8.038847470833712 | 3.53 |
| 4.019423735416856 | 1.765 |
| 4.509711867708428 | 5.883 |
| 4.7548559338542145 | 7.941 |
| 7.377427966927107 | 3.971 |
| 6.188713983463554 | 6.985 |
| 3.094356991731777 | 3.493 |
| 4.0471784958658885 | 6.746 |
| 4.523589247932945 | 8.373 |
| 7.261794623966472 | 4.187 |
| 8.630897311983237 | 2.093 |
| 6.815448655991618 | 6.047 |
| 3.407724327995809 | 3.023 |
| 1.7038621639979046 | 1.512 |
| 5.851931081998952 | 0.756 |
| 5.425965540999476 | 5.378 |
| 5.212982770499738 | 7.689 |
| 2.606491385249869 | 3.844 |
| 3.8032456926249347 | 6.922 |
| 6.901622846312467 | 3.461 |
| 5.9508114231562335 | 6.731 |
| 7.975405711578117 | 3.365 |
| 6.487702855789058 | 6.683 |
| 8.24385142789453 | 3.341 |
| 6.621925713947265 | 6.671 |
| 3.3109628569736325 | 3.335 |
| 4.155481428486816 | 6.668 |
| 4.577740714243408 | 8.334 |
| 7.288870357121704 | 4.167 |
| 3.644435178560852 | 2.083 |
| 6.8222175892804255 | 1.042 |
| 5.911108794640213 | 5.521 |
| 7.955554397320107 | 2.76 |
| 6.477777198660053 | 6.38 |
| 5.738888599330027 | 8.19 |
| 5.369444299665013 | 9.095 |
| 5.184722149832506 | 9.548 |
| 5.092361074916253 | 9.774 |
| 2.5461805374581266 | 4.887 |
| 1.2730902687290633 | 2.443 |
| 3.136545134364532 | 6.222 |
| 4.068272567182266 | 8.111 |
| 2.034136283591133 | 4.055 |
| 6.0170681417955665 | 2.028 |
| 8.008534070897783 | 1.014 |
| 9.00426703544889 | 0.507 |
| 4.502133517724445 | 0.253 |
| 7.251066758862223 | 0.127 |
| 8.625533379431111 | 0.063 |
| 9.312766689715556 | 0.032 |
| 9.656383344857778 | 0.016 |
| 9.82819167242889 | 0.008 |
| 9.914095836214445 | 0.004 |
| 9.957047918107222 | 0.002 |
| 9.97852395905361 | 0.001 |
| 9.989261979526805 | 0 |
| 4.994630989763403 | 0 |
| 7.497315494881701 | 0 |
| 8.74865774744085 | 0 |
| 6.874328873720425 | 5 |
| 5.937164436860213 | 7.5 |
| 7.9685822184301065 | 3.75 |
| 6.484291109215054 | 6.875 |
| 5.742145554607527 | 8.438 |
| 7.871072777303763 | 4.219 |
| 8.935536388651881 | 2.109 |
| 4.467768194325941 | 1.055 |
| 7.233884097162971 | 0.527 |
| 3.6169420485814854 | 0.264 |
| 4.308471024290743 | 5.132 |
| 4.654235512145371 | 7.566 |
| 4.827117756072686 | 8.783 |
| 7.413558878036342 | 4.391 |
| 8.70677943901817 | 2.196 |
| 6.853389719509085 | 6.098 |
| 3.4266948597545426 | 3.049 |
| 4.213347429877271 | 6.524 |
| 4.606673714938635 | 8.262 |
| 4.803336857469318 | 9.131 |
| 4.901668428734659 | 9.566 |
| 2.4508342143673296 | 4.783 |
| 6.225417107183665 | 2.391 |
| 8.112708553591833 | 1.196 |
| 4.056354276795917 | 0.598 |
| 2.0281771383979583 | 0.299 |
| 1.0140885691989792 | 0.149 |
| 5.507044284599489 | 0.075 |
| 7.753522142299745 | 0.037 |
| 8.876761071149872 | 0.019 |
| 9.438380535574936 | 0.009 |
| 9.719190267787468 | 0.005 |
| 7.359595133893734 | 5.002 |
| 3.679797566946867 | 2.501 |
| 1.8398987834734335 | 1.251 |
| 5.919949391736717 | 0.625 |
| 5.459974695868358 | 5.313 |
| 7.729987347934179 | 2.656 |
| 8.864993673967088 | 1.328 |
| 4.432496836983544 | 0.664 |
| 4.716248418491772 | 5.332 |
| 2.358124209245886 | 2.666 |
| 3.6790621046229433 | 6.333 |
| 1.8395310523114716 | 3.167 |
| 5.919765526155736 | 1.583 |
| 2.959882763077868 | 0.792 |
| 1.479941381538934 | 0.396 |
| 0.739970690769467 | 0.198 |
| 0.3699853453847335 | 0.099 |
| 0.18499267269236674 | 0.049 |
| 0.09249633634618337 | 0.025 |
| 0.046248168173091686 | 0.012 |
| 5.023124084086546 | 0.006 |
| 2.511562042043273 | 0.003 |
| 1.2557810210216365 | 0.002 |
| 5.627890510510818 | 0.001 |
| 2.813945255255409 | 0 |
| 6.406972627627704 | 0 |
| 8.203486313813851 | 0 |
| 9.101743156906926 | 0 |
| 9.550871578453464 | 0 |
| 4.775435789226732 | 0 |
| 7.387717894613366 | 0 |
| 8.693858947306683 | 0 |
| 9.346929473653342 | 0 |
| 7.173464736826671 | 5 |
| 8.586732368413335 | 2.5 |
| 9.293366184206668 | 1.25 |
| 7.146683092103334 | 5.625 |
| 6.073341546051667 | 7.813 |
| 5.5366707730258335 | 8.906 |
| 5.268335386512916 | 9.453 |
| 7.634167693256458 | 4.727 |
| 6.317083846628229 | 7.363 |
| 5.6585419233141145 | 8.682 |
| 5.329270961657057 | 9.341 |
| 7.664635480828529 | 4.67 |
| 3.8323177404142643 | 2.335 |
| 4.416158870207132 | 6.168 |
| 2.208079435103566 | 3.084 |
| 3.604039717551783 | 6.542 |
| 1.8020198587758915 | 3.271 |
| 0.9010099293879458 | 1.635 |
| 5.450504964693972 | 0.818 |
| 2.725252482346986 | 0.409 |
| 1.362626241173493 | 0.204 |
| 5.681313120586747 | 0.102 |
| 5.3406565602933735 | 5.051 |
| 7.670328280146687 | 2.526 |
| 6.335164140073344 | 6.263 |
| 8.167582070036673 | 3.131 |
| 6.583791035018336 | 6.566 |
| 8.291895517509168 | 3.283 |
| 4.145947758754584 | 1.641 |
| 4.572973879377292 | 5.821 |
| 4.786486939688646 | 7.91 |
| 2.393243469844323 | 3.955 |
| 6.196621734922161 | 1.978 |
| 5.59831086746108 | 5.989 |
| 5.29915543373054 | 7.994 |
| 7.64957771686527 | 3.997 |
| 6.324788858432635 | 6.999 |
| 3.1623944292163175 | 3.499 |
| 1.5811972146081588 | 1.75 |
| 3.290598607304079 | 5.875 |
| 4.14529930365204 | 7.937 |
| 4.57264965182602 | 8.969 |
| 2.28632482591301 | 4.484 |
| 3.643162412956505 | 7.242 |
| 1.8215812064782524 | 3.621 |
| 0.9107906032391262 | 1.811 |
| 5.455395301619562 | 0.905 |
| 7.727697650809781 | 0.453 |
| 8.86384882540489 | 0.226 |
| 4.431924412702445 | 0.113 |
| 7.2159622063512225 | 0.057 |
| 3.6079811031756113 | 0.028 |
| 1.8039905515878056 | 0.014 |
| 0.9019952757939028 | 0.007 |
| 0.4509976378969514 | 0.004 |
| 5.225498818948475 | 0.002 |
| 5.112749409474238 | 5.001 |
| 2.556374704737119 | 2.5 |
| 6.27818735236856 | 1.25 |
| 3.13909367618428 | 0.625 |
| 1.56954683809214 | 0.313 |
| 3.2847734190460702 | 5.156 |
| 4.142386709523035 | 7.578 |
| 4.571193354761517 | 8.789 |
| 7.285596677380759 | 4.395 |
| 6.14279833869038 | 7.197 |
| 8.07139916934519 | 3.599 |
| 6.535699584672595 | 6.799 |
| 5.767849792336298 | 8.4 |
| 5.383924896168149 | 9.2 |
| 2.6919624480840745 | 4.6 |
| 1.3459812240420372 | 2.3 |
| 0.6729906120210186 | 1.15 |
| 0.3364953060105093 | 0.575 |
| 2.6682476530052543 | 5.287 |
| 6.334123826502627 | 2.644 |
| 8.167061913251313 | 1.322 |
| 9.083530956625657 | 0.661 |
| 7.041765478312828 | 5.33 |
| 8.520882739156415 | 2.665 |
| 6.760441369578207 | 6.333 |
| 3.3802206847891036 | 3.166 |
| 1.6901103423945518 | 1.583 |
| 0.8450551711972759 | 0.792 |
| 2.9225275855986377 | 5.396 |
| 1.4612637927993188 | 2.698 |
| 3.230631896399659 | 6.349 |
| 4.11531594819983 | 8.174 |
| 7.057657974099914 | 4.087 |
| 3.528828987049957 | 2.044 |
| 6.764414493524979 | 1.022 |
| 5.882207246762489 | 5.511 |
| 2.9411036233812444 | 2.755 |
| 6.470551811690623 | 1.378 |
| 8.235275905845311 | 0.689 |
| 6.617637952922656 | 5.344 |
| 3.308818976461328 | 2.672 |
| 6.654409488230664 | 1.336 |
| 8.327204744115331 | 0.668 |
| 6.663602372057666 | 5.334 |
| 5.831801186028833 | 7.667 |
| 5.415900593014417 | 8.834 |
| 7.707950296507208 | 4.417 |
| 8.853975148253603 | 2.208 |
| 4.426987574126802 | 1.104 |
| 2.213493787063401 | 0.552 |
| 3.6067468935317004 | 5.276 |
| 1.8033734467658502 | 2.638 |
| 5.901686723382925 | 1.319 |
| 2.9508433616914624 | 0.66 |
| 1.4754216808457312 | 0.33 |
| 3.2377108404228654 | 5.165 |
| 1.6188554202114327 | 2.582 |
| 3.3094277101057163 | 6.291 |
| 1.6547138550528582 | 3.146 |
| 0.8273569275264291 | 1.573 |
| 2.9136784637632145 | 5.786 |
| 1.4568392318816072 | 2.893 |
| 5.728419615940803 | 1.447 |
| 2.8642098079704015 | 0.723 |
| 3.9321049039852007 | 5.362 |
| 4.4660524519926 | 7.681 |
| 2.2330262259963 | 3.84 |
| 1.11651311299815 | 1.92 |
| 3.0582565564990754 | 5.96 |
| 6.529128278249537 | 2.98 |
| 3.2645641391247686 | 1.49 |
| 6.632282069562384 | 0.745 |
| 3.316141034781192 | 0.373 |
| 1.658070517390596 | 0.186 |
| 5.829035258695297 | 0.093 |
| 5.414517629347649 | 5.047 |
| 5.207258814673825 | 7.523 |
| 5.103629407336912 | 8.762 |
| 7.551814703668456 | 4.381 |
| 3.775907351834228 | 2.19 |
| 4.387953675917114 | 6.095 |
| 2.193976837958557 | 3.048 |
| 6.0969884189792785 | 1.524 |
| 3.0484942094896392 | 0.762 |
| 6.52424710474482 | 0.381 |
| 3.26212355237241 | 0.19 |
| 6.631061776186205 | 0.095 |
| 5.815530888093102 | 5.048 |
| 2.907765444046551 | 2.524 |
| 6.453882722023275 | 1.262 |
| 8.226941361011637 | 0.631 |
| 9.113470680505818 | 0.315 |
| 9.55673534025291 | 0.158 |
| 9.778367670126455 | 0.079 |
| 7.3891838350632275 | 5.039 |
| 3.6945919175316138 | 2.52 |
| 4.347295958765807 | 6.26 |
| 7.1736479793829036 | 3.13 |
| 8.586823989691451 | 1.565 |
| 6.793411994845726 | 5.782 |
| 8.396705997422863 | 2.891 |
| 4.198352998711432 | 1.446 |
| 7.099176499355716 | 0.723 |
| 8.549588249677857 | 0.361 |
| 9.274794124838929 | 0.181 |
| 7.137397062419464 | 5.09 |
| 3.568698531209732 | 2.545 |
| 6.784349265604867 | 1.273 |
| 5.892174632802433 | 5.636 |
| 5.446087316401217 | 7.818 |
| 5.223043658200608 | 8.909 |
| 7.611521829100305 | 4.455 |
| 6.305760914550152 | 7.227 |
| 3.152880457275076 | 3.614 |
| 6.576440228637538 | 1.807 |
| 3.288220114318769 | 0.903 |
| 1.6441100571593845 | 0.452 |
| 0.8220550285796923 | 0.226 |
| 0.41102751428984613 | 0.113 |
| 2.705513757144923 | 5.056 |
| 1.3527568785724615 | 2.528 |
| 0.6763784392862308 | 1.264 |
| 2.838189219643115 | 5.632 |
| 1.4190946098215576 | 2.816 |
| 0.7095473049107788 | 1.408 |
| 5.35477365245539 | 0.704 |
| 5.1773868262276945 | 5.352 |
| 7.588693413113847 | 2.676 |
| 6.294346706556924 | 6.338 |
| 3.147173353278462 | 3.169 |
| 1.573586676639231 | 1.585 |
| 3.2867933383196153 | 5.792 |
| 6.643396669159808 | 2.896 |
| 8.321698334579903 | 1.448 |
| 6.6608491672899515 | 5.724 |
| 3.3304245836449757 | 2.862 |
| 4.165212291822488 | 6.431 |
| 7.082606145911244 | 3.216 |
| 3.541303072955622 | 1.608 |
| 4.270651536477811 | 5.804 |
| 4.635325768238905 | 7.902 |
| 7.317662884119453 | 3.951 |
| 3.6588314420597263 | 1.975 |
| 6.8294157210298625 | 0.988 |
| 3.4147078605149312 | 0.494 |
| 6.707353930257465 | 0.247 |
| 5.853676965128733 | 5.123 |
| 7.926838482564366 | 2.562 |
| 3.963419241282183 | 1.281 |
| 1.9817096206410916 | 0.64 |
| 5.990854810320546 | 0.32 |
| 7.995427405160273 | 0.16 |
| 6.497713702580136 | 5.08 |
| 3.248856851290068 | 2.54 |
| 4.124428425645034 | 6.27 |
| 4.562214212822517 | 8.135 |
| 2.2811071064112585 | 4.068 |
| 6.1405535532056295 | 2.034 |
| 3.0702767766028147 | 1.017 |
| 4.035138388301407 | 5.508 |
| 4.5175691941507035 | 7.754 |
| 2.2587845970753517 | 3.877 |
| 1.1293922985376759 | 1.939 |
| 3.064696149268838 | 5.969 |
| 4.0323480746344185 | 7.985 |
| 2.0161740373172092 | 3.992 |
| 3.5080870186586046 | 6.996 |
| 4.2540435093293025 | 8.498 |
| 4.627021754664652 | 9.249 |
| 2.313510877332326 | 4.625 |
| 3.656755438666163 | 7.312 |
| 6.828377719333082 | 3.656 |
| 5.914188859666541 | 6.828 |
| 5.457094429833271 | 8.414 |
| 5.228547214916635 | 9.207 |
| 7.614273607458317 | 4.604 |
| 6.307136803729159 | 7.302 |
| 5.653568401864579 | 8.651 |
| 7.826784200932289 | 4.325 |
| 8.913392100466144 | 2.163 |
| 6.956696050233072 | 6.081 |
| 3.478348025116536 | 3.041 |
| 6.7391740125582675 | 1.52 |
| 5.869587006279134 | 5.76 |
| 5.434793503139566 | 7.88 |
| 5.217396751569783 | 8.94 |
| 7.608698375784892 | 4.47 |
| 3.804349187892446 | 2.235 |
| 1.902174593946223 | 1.118 |
| 3.4510872969731112 | 5.559 |
| 1.7255436484865556 | 2.779 |
| 0.8627718242432778 | 1.39 |
| 2.9313859121216392 | 5.695 |
| 1.4656929560608196 | 2.847 |
| 3.23284647803041 | 6.424 |
| 6.616423239015205 | 3.212 |
| 8.308211619507603 | 1.606 |
| 9.154105809753801 | 0.803 |
| 7.077052904876901 | 5.401 |
| 3.5385264524384503 | 2.701 |
| 4.269263226219225 | 6.35 |
| 2.1346316131096126 | 3.175 |
| 6.067315806554806 | 1.588 |
| 8.033657903277403 | 0.794 |
| 6.5168289516387015 | 5.397 |
| 3.2584144758193507 | 2.698 |
| 4.129207237909675 | 6.349 |
| 4.564603618954838 | 8.175 |
| 4.782301809477419 | 9.087 |
| 4.891150904738709 | 9.544 |
| 2.4455754523693547 | 4.772 |
| 1.2227877261846773 | 2.386 |
| 5.611393863092339 | 1.193 |
| 7.805696931546169 | 0.596 |
| 8.902848465773085 | 0.298 |
| 6.951424232886542 | 5.149 |
| 3.475712116443271 | 2.575 |
| 4.237856058221635 | 6.287 |
| 7.118928029110817 | 3.144 |
| 8.55946401455541 | 1.572 |
| 9.279732007277705 | 0.786 |
| 9.639866003638852 | 0.393 |
| 9.819933001819425 | 0.196 |
| 7.409966500909713 | 5.098 |
| 8.704983250454855 | 2.549 |
| 6.852491625227428 | 6.275 |
| 5.926245812613714 | 8.137 |
| 2.963122906306857 | 4.069 |
| 3.9815614531534287 | 7.034 |
| 4.490780726576714 | 8.517 |
| 7.245390363288357 | 4.259 |
| 6.122695181644179 | 7.129 |
| 3.0613475908220895 | 3.565 |
| 6.530673795411045 | 1.782 |
| 3.2653368977055224 | 0.891 |
| 6.632668448852762 | 0.446 |
| 5.816334224426381 | 5.223 |
| 7.9081671122131905 | 2.611 |
| 8.954083556106596 | 1.306 |
| 6.977041778053298 | 5.653 |
| 5.988520889026649 | 7.826 |
| 7.9942604445133245 | 3.913 |
| 3.9971302222566623 | 1.957 |
| 4.498565111128331 | 5.978 |
| 7.249282555564165 | 2.989 |
| 6.124641277782082 | 6.495 |
| 3.062320638891041 | 3.247 |
| 6.531160319445521 | 1.624 |
| 8.26558015972276 | 0.812 |
| 4.13279007986138 | 0.406 |
| 2.06639503993069 | 0.203 |
| 6.033197519965345 | 0.101 |
| 3.0165987599826725 | 0.051 |
| 6.508299379991336 | 0.025 |
| 3.254149689995668 | 0.013 |
| 6.627074844997834 | 0.006 |
| 8.313537422498918 | 0.003 |
| 6.656768711249459 | 5.002 |
| 5.8283843556247295 | 7.501 |
| 2.9141921778123647 | 3.75 |
| 6.457096088906182 | 1.875 |
| 8.228548044453092 | 0.938 |
| 4.114274022226546 | 0.469 |
| 7.057137011113273 | 0.234 |
| 8.528568505556636 | 0.117 |
| 9.264284252778317 | 0.059 |
| 4.632142126389159 | 0.029 |
| 2.3160710631945793 | 0.015 |
| 1.1580355315972897 | 0.007 |
| 3.079017765798645 | 5.004 |
| 1.5395088828993224 | 2.502 |
| 3.2697544414496615 | 6.251 |
| 4.134877220724831 | 8.125 |
| 7.067438610362416 | 4.063 |
| 8.533719305181208 | 2.031 |
| 9.266859652590604 | 1.016 |
| 4.633429826295302 | 0.508 |
| 7.316714913147651 | 0.254 |
| 6.1583574565738255 | 5.127 |
| 5.579178728286912 | 7.563 |
| 2.789589364143456 | 3.782 |
| 3.894794682071728 | 6.891 |
| 4.447397341035864 | 8.445 |
| 4.723698670517932 | 9.223 |
| 4.861849335258966 | 9.611 |
| 4.930924667629483 | 9.806 |
| 7.465462333814742 | 4.903 |
| 6.232731166907371 | 7.451 |
| 8.116365583453685 | 3.726 |
| 9.058182791726843 | 1.863 |
| 4.529091395863421 | 0.931 |
| 2.2645456979317107 | 0.466 |
| 1.1322728489658553 | 0.233 |
| 3.0661364244829277 | 5.116 |
| 6.533068212241464 | 2.558 |
| 5.766534106120732 | 6.279 |
| 7.883267053060366 | 3.14 |
| 6.4416335265301825 | 6.57 |
| 3.2208167632650913 | 3.285 |
| 6.610408381632546 | 1.642 |
| 5.805204190816273 | 5.821 |
| 7.902602095408136 | 2.911 |
| 8.951301047704067 | 1.455 |
| 9.475650523852034 | 0.728 |
| 7.237825261926017 | 5.364 |
| 3.6189126309630084 | 2.682 |
| 6.809456315481505 | 1.341 |
| 3.4047281577407524 | 0.67 |
| 1.7023640788703762 | 0.335 |
| 3.351182039435188 | 5.168 |
| 1.675591019717594 | 2.584 |
| 0.837795509858797 | 1.292 |
| 2.9188977549293984 | 5.646 |
| 3.959448877464699 | 7.823 |
| 4.479724438732349 | 8.911 |
| 4.739862219366175 | 9.456 |
| 2.3699311096830873 | 4.728 |
| 6.184965554841543 | 2.364 |
| 3.0924827774207717 | 1.182 |
| 1.5462413887103859 | 0.591 |
| 0.7731206943551929 | 0.295 |